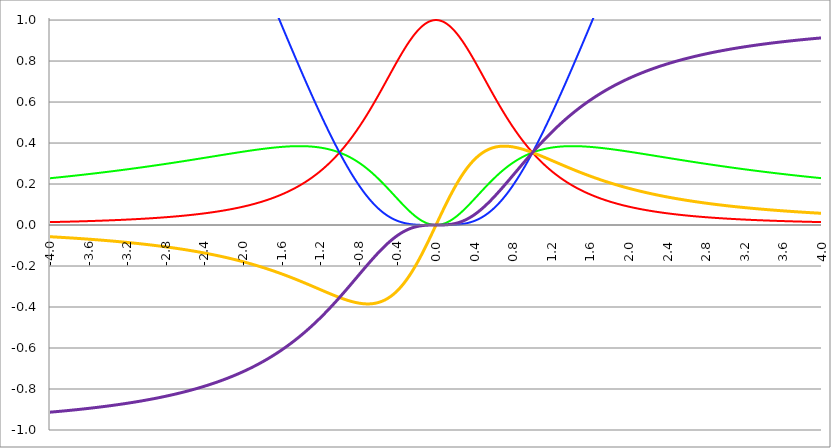
| Category | Series 1 | Series 0 | Series 2 | Series 3 | Series 4 |
|---|---|---|---|---|---|
| -4.0 | 0.014 | 0.228 | 3.652 | -0.057 | -0.913 |
| -3.996 | 0.014 | 0.228 | 3.648 | -0.057 | -0.913 |
| -3.992 | 0.014 | 0.229 | 3.644 | -0.057 | -0.913 |
| -3.988 | 0.014 | 0.229 | 3.639 | -0.057 | -0.913 |
| -3.984 | 0.014 | 0.229 | 3.635 | -0.057 | -0.912 |
| -3.98 | 0.014 | 0.229 | 3.631 | -0.058 | -0.912 |
| -3.976 | 0.015 | 0.229 | 3.627 | -0.058 | -0.912 |
| -3.972 | 0.015 | 0.23 | 3.622 | -0.058 | -0.912 |
| -3.968 | 0.015 | 0.23 | 3.618 | -0.058 | -0.912 |
| -3.964 | 0.015 | 0.23 | 3.614 | -0.058 | -0.912 |
| -3.96 | 0.015 | 0.23 | 3.609 | -0.058 | -0.911 |
| -3.956 | 0.015 | 0.23 | 3.605 | -0.058 | -0.911 |
| -3.952 | 0.015 | 0.231 | 3.601 | -0.058 | -0.911 |
| -3.948 | 0.015 | 0.231 | 3.596 | -0.058 | -0.911 |
| -3.944 | 0.015 | 0.231 | 3.592 | -0.059 | -0.911 |
| -3.94 | 0.015 | 0.231 | 3.588 | -0.059 | -0.911 |
| -3.936 | 0.015 | 0.231 | 3.583 | -0.059 | -0.91 |
| -3.932 | 0.015 | 0.232 | 3.579 | -0.059 | -0.91 |
| -3.928 | 0.015 | 0.232 | 3.575 | -0.059 | -0.91 |
| -3.924 | 0.015 | 0.232 | 3.571 | -0.059 | -0.91 |
| -3.92 | 0.015 | 0.232 | 3.566 | -0.059 | -0.91 |
| -3.916 | 0.015 | 0.232 | 3.562 | -0.059 | -0.91 |
| -3.912 | 0.015 | 0.232 | 3.558 | -0.059 | -0.909 |
| -3.908 | 0.015 | 0.233 | 3.553 | -0.06 | -0.909 |
| -3.904 | 0.015 | 0.233 | 3.549 | -0.06 | -0.909 |
| -3.9 | 0.015 | 0.233 | 3.545 | -0.06 | -0.909 |
| -3.896 | 0.015 | 0.233 | 3.54 | -0.06 | -0.909 |
| -3.892 | 0.015 | 0.233 | 3.536 | -0.06 | -0.909 |
| -3.888 | 0.015 | 0.234 | 3.532 | -0.06 | -0.908 |
| -3.884 | 0.016 | 0.234 | 3.527 | -0.06 | -0.908 |
| -3.88 | 0.016 | 0.234 | 3.523 | -0.06 | -0.908 |
| -3.876 | 0.016 | 0.234 | 3.519 | -0.06 | -0.908 |
| -3.872 | 0.016 | 0.234 | 3.515 | -0.061 | -0.908 |
| -3.868 | 0.016 | 0.235 | 3.51 | -0.061 | -0.908 |
| -3.864 | 0.016 | 0.235 | 3.506 | -0.061 | -0.907 |
| -3.86 | 0.016 | 0.235 | 3.502 | -0.061 | -0.907 |
| -3.856 | 0.016 | 0.235 | 3.497 | -0.061 | -0.907 |
| -3.852 | 0.016 | 0.235 | 3.493 | -0.061 | -0.907 |
| -3.848 | 0.016 | 0.236 | 3.489 | -0.061 | -0.907 |
| -3.844 | 0.016 | 0.236 | 3.484 | -0.061 | -0.906 |
| -3.84 | 0.016 | 0.236 | 3.48 | -0.061 | -0.906 |
| -3.836 | 0.016 | 0.236 | 3.476 | -0.062 | -0.906 |
| -3.832 | 0.016 | 0.236 | 3.471 | -0.062 | -0.906 |
| -3.828 | 0.016 | 0.237 | 3.467 | -0.062 | -0.906 |
| -3.824 | 0.016 | 0.237 | 3.463 | -0.062 | -0.906 |
| -3.82 | 0.016 | 0.237 | 3.458 | -0.062 | -0.905 |
| -3.816 | 0.016 | 0.237 | 3.454 | -0.062 | -0.905 |
| -3.812 | 0.016 | 0.237 | 3.45 | -0.062 | -0.905 |
| -3.808 | 0.016 | 0.238 | 3.446 | -0.062 | -0.905 |
| -3.804 | 0.016 | 0.238 | 3.441 | -0.063 | -0.905 |
| -3.8 | 0.016 | 0.238 | 3.437 | -0.063 | -0.904 |
| -3.796 | 0.017 | 0.238 | 3.433 | -0.063 | -0.904 |
| -3.792 | 0.017 | 0.238 | 3.428 | -0.063 | -0.904 |
| -3.788 | 0.017 | 0.239 | 3.424 | -0.063 | -0.904 |
| -3.784 | 0.017 | 0.239 | 3.42 | -0.063 | -0.904 |
| -3.78 | 0.017 | 0.239 | 3.415 | -0.063 | -0.904 |
| -3.776 | 0.017 | 0.239 | 3.411 | -0.063 | -0.903 |
| -3.772 | 0.017 | 0.239 | 3.407 | -0.063 | -0.903 |
| -3.768 | 0.017 | 0.24 | 3.402 | -0.064 | -0.903 |
| -3.764 | 0.017 | 0.24 | 3.398 | -0.064 | -0.903 |
| -3.76 | 0.017 | 0.24 | 3.394 | -0.064 | -0.903 |
| -3.756 | 0.017 | 0.24 | 3.389 | -0.064 | -0.902 |
| -3.752 | 0.017 | 0.24 | 3.385 | -0.064 | -0.902 |
| -3.748 | 0.017 | 0.241 | 3.381 | -0.064 | -0.902 |
| -3.744 | 0.017 | 0.241 | 3.376 | -0.064 | -0.902 |
| -3.74 | 0.017 | 0.241 | 3.372 | -0.064 | -0.902 |
| -3.736 | 0.017 | 0.241 | 3.368 | -0.065 | -0.901 |
| -3.732 | 0.017 | 0.241 | 3.363 | -0.065 | -0.901 |
| -3.728 | 0.017 | 0.242 | 3.359 | -0.065 | -0.901 |
| -3.724 | 0.017 | 0.242 | 3.355 | -0.065 | -0.901 |
| -3.72 | 0.017 | 0.242 | 3.35 | -0.065 | -0.901 |
| -3.716 | 0.018 | 0.242 | 3.346 | -0.065 | -0.9 |
| -3.712 | 0.018 | 0.243 | 3.342 | -0.065 | -0.9 |
| -3.708 | 0.018 | 0.243 | 3.337 | -0.065 | -0.9 |
| -3.704 | 0.018 | 0.243 | 3.333 | -0.066 | -0.9 |
| -3.7 | 0.018 | 0.243 | 3.329 | -0.066 | -0.9 |
| -3.696 | 0.018 | 0.243 | 3.324 | -0.066 | -0.899 |
| -3.692 | 0.018 | 0.244 | 3.32 | -0.066 | -0.899 |
| -3.688 | 0.018 | 0.244 | 3.316 | -0.066 | -0.899 |
| -3.684 | 0.018 | 0.244 | 3.311 | -0.066 | -0.899 |
| -3.68 | 0.018 | 0.244 | 3.307 | -0.066 | -0.899 |
| -3.676 | 0.018 | 0.244 | 3.303 | -0.066 | -0.898 |
| -3.672 | 0.018 | 0.245 | 3.298 | -0.067 | -0.898 |
| -3.668 | 0.018 | 0.245 | 3.294 | -0.067 | -0.898 |
| -3.664 | 0.018 | 0.245 | 3.29 | -0.067 | -0.898 |
| -3.66 | 0.018 | 0.245 | 3.285 | -0.067 | -0.898 |
| -3.656 | 0.018 | 0.245 | 3.281 | -0.067 | -0.897 |
| -3.652 | 0.018 | 0.246 | 3.277 | -0.067 | -0.897 |
| -3.648 | 0.018 | 0.246 | 3.272 | -0.067 | -0.897 |
| -3.644 | 0.019 | 0.246 | 3.268 | -0.068 | -0.897 |
| -3.64 | 0.019 | 0.246 | 3.264 | -0.068 | -0.897 |
| -3.636 | 0.019 | 0.247 | 3.259 | -0.068 | -0.896 |
| -3.632 | 0.019 | 0.247 | 3.255 | -0.068 | -0.896 |
| -3.628 | 0.019 | 0.247 | 3.251 | -0.068 | -0.896 |
| -3.624 | 0.019 | 0.247 | 3.246 | -0.068 | -0.896 |
| -3.62 | 0.019 | 0.247 | 3.242 | -0.068 | -0.896 |
| -3.616 | 0.019 | 0.248 | 3.238 | -0.068 | -0.895 |
| -3.612 | 0.019 | 0.248 | 3.233 | -0.069 | -0.895 |
| -3.608 | 0.019 | 0.248 | 3.229 | -0.069 | -0.895 |
| -3.604 | 0.019 | 0.248 | 3.225 | -0.069 | -0.895 |
| -3.6 | 0.019 | 0.248 | 3.22 | -0.069 | -0.894 |
| -3.596 | 0.019 | 0.249 | 3.216 | -0.069 | -0.894 |
| -3.592 | 0.019 | 0.249 | 3.211 | -0.069 | -0.894 |
| -3.588 | 0.019 | 0.249 | 3.207 | -0.069 | -0.894 |
| -3.584 | 0.019 | 0.249 | 3.203 | -0.07 | -0.894 |
| -3.58 | 0.019 | 0.25 | 3.198 | -0.07 | -0.893 |
| -3.576 | 0.02 | 0.25 | 3.194 | -0.07 | -0.893 |
| -3.572 | 0.02 | 0.25 | 3.19 | -0.07 | -0.893 |
| -3.568 | 0.02 | 0.25 | 3.185 | -0.07 | -0.893 |
| -3.564 | 0.02 | 0.25 | 3.181 | -0.07 | -0.893 |
| -3.56 | 0.02 | 0.251 | 3.177 | -0.07 | -0.892 |
| -3.556 | 0.02 | 0.251 | 3.172 | -0.071 | -0.892 |
| -3.552 | 0.02 | 0.251 | 3.168 | -0.071 | -0.892 |
| -3.548 | 0.02 | 0.251 | 3.164 | -0.071 | -0.892 |
| -3.544 | 0.02 | 0.252 | 3.159 | -0.071 | -0.891 |
| -3.54 | 0.02 | 0.252 | 3.155 | -0.071 | -0.891 |
| -3.536 | 0.02 | 0.252 | 3.151 | -0.071 | -0.891 |
| -3.532 | 0.02 | 0.252 | 3.146 | -0.071 | -0.891 |
| -3.528 | 0.02 | 0.252 | 3.142 | -0.072 | -0.891 |
| -3.524 | 0.02 | 0.253 | 3.138 | -0.072 | -0.89 |
| -3.52 | 0.02 | 0.253 | 3.133 | -0.072 | -0.89 |
| -3.516 | 0.02 | 0.253 | 3.129 | -0.072 | -0.89 |
| -3.512 | 0.021 | 0.253 | 3.124 | -0.072 | -0.89 |
| -3.508 | 0.021 | 0.254 | 3.12 | -0.072 | -0.889 |
| -3.504 | 0.021 | 0.254 | 3.116 | -0.072 | -0.889 |
| -3.5 | 0.021 | 0.254 | 3.111 | -0.073 | -0.889 |
| -3.496 | 0.021 | 0.254 | 3.107 | -0.073 | -0.889 |
| -3.492 | 0.021 | 0.254 | 3.103 | -0.073 | -0.888 |
| -3.488 | 0.021 | 0.255 | 3.098 | -0.073 | -0.888 |
| -3.484 | 0.021 | 0.255 | 3.094 | -0.073 | -0.888 |
| -3.48 | 0.021 | 0.255 | 3.09 | -0.073 | -0.888 |
| -3.476 | 0.021 | 0.255 | 3.085 | -0.073 | -0.888 |
| -3.472 | 0.021 | 0.256 | 3.081 | -0.074 | -0.887 |
| -3.467999999999999 | 0.021 | 0.256 | 3.076 | -0.074 | -0.887 |
| -3.463999999999999 | 0.021 | 0.256 | 3.072 | -0.074 | -0.887 |
| -3.459999999999999 | 0.021 | 0.256 | 3.068 | -0.074 | -0.887 |
| -3.455999999999999 | 0.021 | 0.256 | 3.063 | -0.074 | -0.886 |
| -3.451999999999999 | 0.022 | 0.257 | 3.059 | -0.074 | -0.886 |
| -3.447999999999999 | 0.022 | 0.257 | 3.055 | -0.075 | -0.886 |
| -3.443999999999999 | 0.022 | 0.257 | 3.05 | -0.075 | -0.886 |
| -3.439999999999999 | 0.022 | 0.257 | 3.046 | -0.075 | -0.885 |
| -3.435999999999999 | 0.022 | 0.258 | 3.041 | -0.075 | -0.885 |
| -3.431999999999999 | 0.022 | 0.258 | 3.037 | -0.075 | -0.885 |
| -3.427999999999999 | 0.022 | 0.258 | 3.033 | -0.075 | -0.885 |
| -3.423999999999999 | 0.022 | 0.258 | 3.028 | -0.075 | -0.884 |
| -3.419999999999999 | 0.022 | 0.259 | 3.024 | -0.076 | -0.884 |
| -3.415999999999999 | 0.022 | 0.259 | 3.02 | -0.076 | -0.884 |
| -3.411999999999999 | 0.022 | 0.259 | 3.015 | -0.076 | -0.884 |
| -3.407999999999999 | 0.022 | 0.259 | 3.011 | -0.076 | -0.883 |
| -3.403999999999999 | 0.022 | 0.259 | 3.007 | -0.076 | -0.883 |
| -3.399999999999999 | 0.022 | 0.26 | 3.002 | -0.076 | -0.883 |
| -3.395999999999999 | 0.023 | 0.26 | 2.998 | -0.077 | -0.883 |
| -3.391999999999999 | 0.023 | 0.26 | 2.993 | -0.077 | -0.882 |
| -3.387999999999999 | 0.023 | 0.26 | 2.989 | -0.077 | -0.882 |
| -3.383999999999999 | 0.023 | 0.261 | 2.985 | -0.077 | -0.882 |
| -3.379999999999999 | 0.023 | 0.261 | 2.98 | -0.077 | -0.882 |
| -3.375999999999999 | 0.023 | 0.261 | 2.976 | -0.077 | -0.881 |
| -3.371999999999999 | 0.023 | 0.261 | 2.971 | -0.078 | -0.881 |
| -3.367999999999999 | 0.023 | 0.262 | 2.967 | -0.078 | -0.881 |
| -3.363999999999999 | 0.023 | 0.262 | 2.963 | -0.078 | -0.881 |
| -3.359999999999999 | 0.023 | 0.262 | 2.958 | -0.078 | -0.88 |
| -3.355999999999999 | 0.023 | 0.262 | 2.954 | -0.078 | -0.88 |
| -3.351999999999999 | 0.023 | 0.263 | 2.95 | -0.078 | -0.88 |
| -3.347999999999999 | 0.023 | 0.263 | 2.945 | -0.078 | -0.88 |
| -3.343999999999999 | 0.024 | 0.263 | 2.941 | -0.079 | -0.879 |
| -3.339999999999999 | 0.024 | 0.263 | 2.936 | -0.079 | -0.879 |
| -3.335999999999999 | 0.024 | 0.263 | 2.932 | -0.079 | -0.879 |
| -3.331999999999999 | 0.024 | 0.264 | 2.928 | -0.079 | -0.879 |
| -3.327999999999999 | 0.024 | 0.264 | 2.923 | -0.079 | -0.878 |
| -3.323999999999999 | 0.024 | 0.264 | 2.919 | -0.079 | -0.878 |
| -3.319999999999999 | 0.024 | 0.264 | 2.915 | -0.08 | -0.878 |
| -3.315999999999999 | 0.024 | 0.265 | 2.91 | -0.08 | -0.878 |
| -3.311999999999999 | 0.024 | 0.265 | 2.906 | -0.08 | -0.877 |
| -3.307999999999999 | 0.024 | 0.265 | 2.901 | -0.08 | -0.877 |
| -3.303999999999999 | 0.024 | 0.265 | 2.897 | -0.08 | -0.877 |
| -3.299999999999999 | 0.024 | 0.266 | 2.893 | -0.08 | -0.877 |
| -3.295999999999999 | 0.024 | 0.266 | 2.888 | -0.081 | -0.876 |
| -3.291999999999999 | 0.025 | 0.266 | 2.884 | -0.081 | -0.876 |
| -3.288 | 0.025 | 0.266 | 2.879 | -0.081 | -0.876 |
| -3.284 | 0.025 | 0.267 | 2.875 | -0.081 | -0.875 |
| -3.279999999999999 | 0.025 | 0.267 | 2.871 | -0.081 | -0.875 |
| -3.275999999999999 | 0.025 | 0.267 | 2.866 | -0.082 | -0.875 |
| -3.271999999999999 | 0.025 | 0.267 | 2.862 | -0.082 | -0.875 |
| -3.268 | 0.025 | 0.268 | 2.857 | -0.082 | -0.874 |
| -3.264 | 0.025 | 0.268 | 2.853 | -0.082 | -0.874 |
| -3.259999999999999 | 0.025 | 0.268 | 2.849 | -0.082 | -0.874 |
| -3.255999999999999 | 0.025 | 0.268 | 2.844 | -0.082 | -0.874 |
| -3.251999999999999 | 0.025 | 0.269 | 2.84 | -0.083 | -0.873 |
| -3.248 | 0.025 | 0.269 | 2.835 | -0.083 | -0.873 |
| -3.244 | 0.026 | 0.269 | 2.831 | -0.083 | -0.873 |
| -3.239999999999999 | 0.026 | 0.269 | 2.827 | -0.083 | -0.872 |
| -3.235999999999999 | 0.026 | 0.27 | 2.822 | -0.083 | -0.872 |
| -3.231999999999999 | 0.026 | 0.27 | 2.818 | -0.083 | -0.872 |
| -3.228 | 0.026 | 0.27 | 2.813 | -0.084 | -0.872 |
| -3.224 | 0.026 | 0.27 | 2.809 | -0.084 | -0.871 |
| -3.219999999999999 | 0.026 | 0.27 | 2.805 | -0.084 | -0.871 |
| -3.215999999999999 | 0.026 | 0.271 | 2.8 | -0.084 | -0.871 |
| -3.211999999999999 | 0.026 | 0.271 | 2.796 | -0.084 | -0.87 |
| -3.208 | 0.026 | 0.271 | 2.791 | -0.085 | -0.87 |
| -3.204 | 0.026 | 0.271 | 2.787 | -0.085 | -0.87 |
| -3.199999999999999 | 0.027 | 0.272 | 2.783 | -0.085 | -0.87 |
| -3.195999999999999 | 0.027 | 0.272 | 2.778 | -0.085 | -0.869 |
| -3.191999999999999 | 0.027 | 0.272 | 2.774 | -0.085 | -0.869 |
| -3.188 | 0.027 | 0.272 | 2.769 | -0.085 | -0.869 |
| -3.184 | 0.027 | 0.273 | 2.765 | -0.086 | -0.868 |
| -3.179999999999999 | 0.027 | 0.273 | 2.761 | -0.086 | -0.868 |
| -3.175999999999999 | 0.027 | 0.273 | 2.756 | -0.086 | -0.868 |
| -3.171999999999999 | 0.027 | 0.273 | 2.752 | -0.086 | -0.868 |
| -3.168 | 0.027 | 0.274 | 2.747 | -0.086 | -0.867 |
| -3.164 | 0.027 | 0.274 | 2.743 | -0.087 | -0.867 |
| -3.159999999999999 | 0.027 | 0.274 | 2.738 | -0.087 | -0.867 |
| -3.155999999999999 | 0.028 | 0.274 | 2.734 | -0.087 | -0.866 |
| -3.151999999999999 | 0.028 | 0.275 | 2.73 | -0.087 | -0.866 |
| -3.148 | 0.028 | 0.275 | 2.725 | -0.087 | -0.866 |
| -3.144 | 0.028 | 0.275 | 2.721 | -0.088 | -0.865 |
| -3.139999999999999 | 0.028 | 0.276 | 2.716 | -0.088 | -0.865 |
| -3.135999999999999 | 0.028 | 0.276 | 2.712 | -0.088 | -0.865 |
| -3.131999999999999 | 0.028 | 0.276 | 2.708 | -0.088 | -0.864 |
| -3.128 | 0.028 | 0.276 | 2.703 | -0.088 | -0.864 |
| -3.124 | 0.028 | 0.277 | 2.699 | -0.089 | -0.864 |
| -3.119999999999999 | 0.028 | 0.277 | 2.694 | -0.089 | -0.864 |
| -3.115999999999999 | 0.029 | 0.277 | 2.69 | -0.089 | -0.863 |
| -3.111999999999999 | 0.029 | 0.277 | 2.685 | -0.089 | -0.863 |
| -3.108 | 0.029 | 0.278 | 2.681 | -0.089 | -0.863 |
| -3.104 | 0.029 | 0.278 | 2.677 | -0.09 | -0.862 |
| -3.099999999999999 | 0.029 | 0.278 | 2.672 | -0.09 | -0.862 |
| -3.095999999999999 | 0.029 | 0.278 | 2.668 | -0.09 | -0.862 |
| -3.091999999999999 | 0.029 | 0.279 | 2.663 | -0.09 | -0.861 |
| -3.088 | 0.029 | 0.279 | 2.659 | -0.09 | -0.861 |
| -3.084 | 0.029 | 0.279 | 2.655 | -0.09 | -0.861 |
| -3.079999999999999 | 0.029 | 0.279 | 2.65 | -0.091 | -0.86 |
| -3.075999999999999 | 0.03 | 0.28 | 2.646 | -0.091 | -0.86 |
| -3.071999999999999 | 0.03 | 0.28 | 2.641 | -0.091 | -0.86 |
| -3.068 | 0.03 | 0.28 | 2.637 | -0.091 | -0.859 |
| -3.064 | 0.03 | 0.28 | 2.632 | -0.092 | -0.859 |
| -3.059999999999999 | 0.03 | 0.281 | 2.628 | -0.092 | -0.859 |
| -3.055999999999999 | 0.03 | 0.281 | 2.624 | -0.092 | -0.858 |
| -3.051999999999999 | 0.03 | 0.281 | 2.619 | -0.092 | -0.858 |
| -3.048 | 0.03 | 0.281 | 2.615 | -0.092 | -0.858 |
| -3.044 | 0.03 | 0.282 | 2.61 | -0.093 | -0.858 |
| -3.039999999999999 | 0.031 | 0.282 | 2.606 | -0.093 | -0.857 |
| -3.035999999999999 | 0.031 | 0.282 | 2.601 | -0.093 | -0.857 |
| -3.031999999999999 | 0.031 | 0.282 | 2.597 | -0.093 | -0.857 |
| -3.028 | 0.031 | 0.283 | 2.593 | -0.093 | -0.856 |
| -3.024 | 0.031 | 0.283 | 2.588 | -0.094 | -0.856 |
| -3.019999999999999 | 0.031 | 0.283 | 2.584 | -0.094 | -0.856 |
| -3.015999999999999 | 0.031 | 0.284 | 2.579 | -0.094 | -0.855 |
| -3.011999999999999 | 0.031 | 0.284 | 2.575 | -0.094 | -0.855 |
| -3.008 | 0.031 | 0.284 | 2.57 | -0.094 | -0.854 |
| -3.004 | 0.032 | 0.284 | 2.566 | -0.095 | -0.854 |
| -2.999999999999999 | 0.032 | 0.285 | 2.561 | -0.095 | -0.854 |
| -2.995999999999999 | 0.032 | 0.285 | 2.557 | -0.095 | -0.853 |
| -2.991999999999999 | 0.032 | 0.285 | 2.553 | -0.095 | -0.853 |
| -2.988 | 0.032 | 0.285 | 2.548 | -0.096 | -0.853 |
| -2.984 | 0.032 | 0.286 | 2.544 | -0.096 | -0.852 |
| -2.979999999999999 | 0.032 | 0.286 | 2.539 | -0.096 | -0.852 |
| -2.975999999999999 | 0.032 | 0.286 | 2.535 | -0.096 | -0.852 |
| -2.971999999999999 | 0.032 | 0.286 | 2.53 | -0.096 | -0.851 |
| -2.968 | 0.033 | 0.287 | 2.526 | -0.097 | -0.851 |
| -2.964 | 0.033 | 0.287 | 2.521 | -0.097 | -0.851 |
| -2.959999999999999 | 0.033 | 0.287 | 2.517 | -0.097 | -0.85 |
| -2.955999999999999 | 0.033 | 0.288 | 2.513 | -0.097 | -0.85 |
| -2.951999999999999 | 0.033 | 0.288 | 2.508 | -0.097 | -0.85 |
| -2.948 | 0.033 | 0.288 | 2.504 | -0.098 | -0.849 |
| -2.944 | 0.033 | 0.288 | 2.499 | -0.098 | -0.849 |
| -2.939999999999999 | 0.033 | 0.289 | 2.495 | -0.098 | -0.849 |
| -2.935999999999999 | 0.034 | 0.289 | 2.49 | -0.098 | -0.848 |
| -2.931999999999999 | 0.034 | 0.289 | 2.486 | -0.099 | -0.848 |
| -2.928 | 0.034 | 0.289 | 2.481 | -0.099 | -0.847 |
| -2.924 | 0.034 | 0.29 | 2.477 | -0.099 | -0.847 |
| -2.919999999999999 | 0.034 | 0.29 | 2.473 | -0.099 | -0.847 |
| -2.915999999999999 | 0.034 | 0.29 | 2.468 | -0.1 | -0.846 |
| -2.911999999999999 | 0.034 | 0.291 | 2.464 | -0.1 | -0.846 |
| -2.908 | 0.034 | 0.291 | 2.459 | -0.1 | -0.846 |
| -2.904 | 0.035 | 0.291 | 2.455 | -0.1 | -0.845 |
| -2.899999999999999 | 0.035 | 0.291 | 2.45 | -0.1 | -0.845 |
| -2.895999999999999 | 0.035 | 0.292 | 2.446 | -0.101 | -0.845 |
| -2.891999999999999 | 0.035 | 0.292 | 2.441 | -0.101 | -0.844 |
| -2.887999999999999 | 0.035 | 0.292 | 2.437 | -0.101 | -0.844 |
| -2.883999999999999 | 0.035 | 0.292 | 2.432 | -0.101 | -0.843 |
| -2.879999999999999 | 0.035 | 0.293 | 2.428 | -0.102 | -0.843 |
| -2.875999999999999 | 0.035 | 0.293 | 2.423 | -0.102 | -0.843 |
| -2.871999999999999 | 0.036 | 0.293 | 2.419 | -0.102 | -0.842 |
| -2.867999999999999 | 0.036 | 0.294 | 2.415 | -0.102 | -0.842 |
| -2.863999999999999 | 0.036 | 0.294 | 2.41 | -0.103 | -0.842 |
| -2.859999999999999 | 0.036 | 0.294 | 2.406 | -0.103 | -0.841 |
| -2.855999999999999 | 0.036 | 0.294 | 2.401 | -0.103 | -0.841 |
| -2.851999999999999 | 0.036 | 0.295 | 2.397 | -0.103 | -0.84 |
| -2.847999999999999 | 0.036 | 0.295 | 2.392 | -0.104 | -0.84 |
| -2.843999999999999 | 0.036 | 0.295 | 2.388 | -0.104 | -0.84 |
| -2.839999999999999 | 0.037 | 0.295 | 2.383 | -0.104 | -0.839 |
| -2.835999999999999 | 0.037 | 0.296 | 2.379 | -0.104 | -0.839 |
| -2.831999999999999 | 0.037 | 0.296 | 2.374 | -0.105 | -0.838 |
| -2.827999999999999 | 0.037 | 0.296 | 2.37 | -0.105 | -0.838 |
| -2.823999999999999 | 0.037 | 0.297 | 2.365 | -0.105 | -0.838 |
| -2.819999999999999 | 0.037 | 0.297 | 2.361 | -0.105 | -0.837 |
| -2.815999999999999 | 0.037 | 0.297 | 2.356 | -0.106 | -0.837 |
| -2.811999999999999 | 0.038 | 0.297 | 2.352 | -0.106 | -0.836 |
| -2.807999999999999 | 0.038 | 0.298 | 2.348 | -0.106 | -0.836 |
| -2.803999999999999 | 0.038 | 0.298 | 2.343 | -0.106 | -0.836 |
| -2.799999999999999 | 0.038 | 0.298 | 2.339 | -0.107 | -0.835 |
| -2.795999999999999 | 0.038 | 0.299 | 2.334 | -0.107 | -0.835 |
| -2.791999999999999 | 0.038 | 0.299 | 2.33 | -0.107 | -0.834 |
| -2.787999999999999 | 0.038 | 0.299 | 2.325 | -0.107 | -0.834 |
| -2.783999999999999 | 0.039 | 0.299 | 2.321 | -0.108 | -0.834 |
| -2.779999999999999 | 0.039 | 0.3 | 2.316 | -0.108 | -0.833 |
| -2.775999999999999 | 0.039 | 0.3 | 2.312 | -0.108 | -0.833 |
| -2.771999999999999 | 0.039 | 0.3 | 2.307 | -0.108 | -0.832 |
| -2.767999999999999 | 0.039 | 0.301 | 2.303 | -0.109 | -0.832 |
| -2.763999999999999 | 0.039 | 0.301 | 2.298 | -0.109 | -0.832 |
| -2.759999999999999 | 0.04 | 0.301 | 2.294 | -0.109 | -0.831 |
| -2.755999999999999 | 0.04 | 0.301 | 2.289 | -0.109 | -0.831 |
| -2.751999999999999 | 0.04 | 0.302 | 2.285 | -0.11 | -0.83 |
| -2.747999999999999 | 0.04 | 0.302 | 2.28 | -0.11 | -0.83 |
| -2.743999999999999 | 0.04 | 0.302 | 2.276 | -0.11 | -0.829 |
| -2.739999999999999 | 0.04 | 0.303 | 2.271 | -0.11 | -0.829 |
| -2.735999999999999 | 0.04 | 0.303 | 2.267 | -0.111 | -0.829 |
| -2.731999999999999 | 0.041 | 0.303 | 2.262 | -0.111 | -0.828 |
| -2.727999999999999 | 0.041 | 0.303 | 2.258 | -0.111 | -0.828 |
| -2.723999999999999 | 0.041 | 0.304 | 2.253 | -0.111 | -0.827 |
| -2.719999999999999 | 0.041 | 0.304 | 2.249 | -0.112 | -0.827 |
| -2.715999999999999 | 0.041 | 0.304 | 2.244 | -0.112 | -0.826 |
| -2.711999999999999 | 0.041 | 0.305 | 2.24 | -0.112 | -0.826 |
| -2.707999999999999 | 0.042 | 0.305 | 2.235 | -0.113 | -0.826 |
| -2.703999999999999 | 0.042 | 0.305 | 2.231 | -0.113 | -0.825 |
| -2.699999999999999 | 0.042 | 0.305 | 2.227 | -0.113 | -0.825 |
| -2.695999999999999 | 0.042 | 0.306 | 2.222 | -0.113 | -0.824 |
| -2.691999999999999 | 0.042 | 0.306 | 2.218 | -0.114 | -0.824 |
| -2.687999999999999 | 0.042 | 0.306 | 2.213 | -0.114 | -0.823 |
| -2.683999999999999 | 0.043 | 0.307 | 2.209 | -0.114 | -0.823 |
| -2.679999999999999 | 0.043 | 0.307 | 2.204 | -0.115 | -0.822 |
| -2.675999999999999 | 0.043 | 0.307 | 2.2 | -0.115 | -0.822 |
| -2.671999999999999 | 0.043 | 0.307 | 2.195 | -0.115 | -0.821 |
| -2.667999999999999 | 0.043 | 0.308 | 2.191 | -0.115 | -0.821 |
| -2.663999999999999 | 0.043 | 0.308 | 2.186 | -0.116 | -0.821 |
| -2.659999999999999 | 0.044 | 0.308 | 2.182 | -0.116 | -0.82 |
| -2.655999999999999 | 0.044 | 0.309 | 2.177 | -0.116 | -0.82 |
| -2.651999999999999 | 0.044 | 0.309 | 2.173 | -0.116 | -0.819 |
| -2.647999999999999 | 0.044 | 0.309 | 2.168 | -0.117 | -0.819 |
| -2.643999999999999 | 0.044 | 0.309 | 2.164 | -0.117 | -0.818 |
| -2.639999999999999 | 0.044 | 0.31 | 2.159 | -0.117 | -0.818 |
| -2.635999999999999 | 0.045 | 0.31 | 2.155 | -0.118 | -0.817 |
| -2.631999999999999 | 0.045 | 0.31 | 2.15 | -0.118 | -0.817 |
| -2.627999999999999 | 0.045 | 0.311 | 2.146 | -0.118 | -0.816 |
| -2.623999999999999 | 0.045 | 0.311 | 2.141 | -0.119 | -0.816 |
| -2.619999999999999 | 0.045 | 0.311 | 2.137 | -0.119 | -0.815 |
| -2.615999999999999 | 0.046 | 0.312 | 2.132 | -0.119 | -0.815 |
| -2.611999999999999 | 0.046 | 0.312 | 2.128 | -0.119 | -0.815 |
| -2.607999999999999 | 0.046 | 0.312 | 2.123 | -0.12 | -0.814 |
| -2.603999999999999 | 0.046 | 0.312 | 2.118 | -0.12 | -0.814 |
| -2.599999999999999 | 0.046 | 0.313 | 2.114 | -0.12 | -0.813 |
| -2.595999999999999 | 0.046 | 0.313 | 2.109 | -0.121 | -0.813 |
| -2.591999999999999 | 0.047 | 0.313 | 2.105 | -0.121 | -0.812 |
| -2.587999999999999 | 0.047 | 0.314 | 2.1 | -0.121 | -0.812 |
| -2.583999999999999 | 0.047 | 0.314 | 2.096 | -0.121 | -0.811 |
| -2.579999999999999 | 0.047 | 0.314 | 2.091 | -0.122 | -0.811 |
| -2.575999999999999 | 0.047 | 0.314 | 2.087 | -0.122 | -0.81 |
| -2.571999999999999 | 0.048 | 0.315 | 2.082 | -0.122 | -0.81 |
| -2.567999999999999 | 0.048 | 0.315 | 2.078 | -0.123 | -0.809 |
| -2.563999999999999 | 0.048 | 0.315 | 2.073 | -0.123 | -0.809 |
| -2.559999999999999 | 0.048 | 0.316 | 2.069 | -0.123 | -0.808 |
| -2.555999999999999 | 0.048 | 0.316 | 2.064 | -0.124 | -0.808 |
| -2.551999999999999 | 0.049 | 0.316 | 2.06 | -0.124 | -0.807 |
| -2.547999999999999 | 0.049 | 0.317 | 2.055 | -0.124 | -0.807 |
| -2.543999999999999 | 0.049 | 0.317 | 2.051 | -0.125 | -0.806 |
| -2.539999999999999 | 0.049 | 0.317 | 2.046 | -0.125 | -0.806 |
| -2.535999999999999 | 0.049 | 0.317 | 2.042 | -0.125 | -0.805 |
| -2.531999999999999 | 0.05 | 0.318 | 2.037 | -0.126 | -0.805 |
| -2.527999999999999 | 0.05 | 0.318 | 2.033 | -0.126 | -0.804 |
| -2.523999999999999 | 0.05 | 0.318 | 2.028 | -0.126 | -0.804 |
| -2.519999999999999 | 0.05 | 0.319 | 2.024 | -0.126 | -0.803 |
| -2.515999999999999 | 0.05 | 0.319 | 2.019 | -0.127 | -0.803 |
| -2.511999999999999 | 0.051 | 0.319 | 2.015 | -0.127 | -0.802 |
| -2.507999999999999 | 0.051 | 0.32 | 2.01 | -0.127 | -0.801 |
| -2.503999999999999 | 0.051 | 0.32 | 2.006 | -0.128 | -0.801 |
| -2.499999999999999 | 0.051 | 0.32 | 2.001 | -0.128 | -0.8 |
| -2.495999999999999 | 0.051 | 0.32 | 1.997 | -0.128 | -0.8 |
| -2.491999999999999 | 0.052 | 0.321 | 1.992 | -0.129 | -0.799 |
| -2.487999999999999 | 0.052 | 0.321 | 1.987 | -0.129 | -0.799 |
| -2.483999999999999 | 0.052 | 0.321 | 1.983 | -0.129 | -0.798 |
| -2.479999999999999 | 0.052 | 0.322 | 1.978 | -0.13 | -0.798 |
| -2.475999999999999 | 0.053 | 0.322 | 1.974 | -0.13 | -0.797 |
| -2.471999999999999 | 0.053 | 0.322 | 1.969 | -0.13 | -0.797 |
| -2.467999999999999 | 0.053 | 0.323 | 1.965 | -0.131 | -0.796 |
| -2.463999999999999 | 0.053 | 0.323 | 1.96 | -0.131 | -0.796 |
| -2.459999999999999 | 0.053 | 0.323 | 1.956 | -0.131 | -0.795 |
| -2.455999999999999 | 0.054 | 0.323 | 1.951 | -0.132 | -0.794 |
| -2.451999999999999 | 0.054 | 0.324 | 1.947 | -0.132 | -0.794 |
| -2.447999999999999 | 0.054 | 0.324 | 1.942 | -0.132 | -0.793 |
| -2.443999999999999 | 0.054 | 0.324 | 1.938 | -0.133 | -0.793 |
| -2.439999999999999 | 0.055 | 0.325 | 1.933 | -0.133 | -0.792 |
| -2.435999999999999 | 0.055 | 0.325 | 1.929 | -0.133 | -0.792 |
| -2.431999999999999 | 0.055 | 0.325 | 1.924 | -0.134 | -0.791 |
| -2.427999999999999 | 0.055 | 0.326 | 1.919 | -0.134 | -0.791 |
| -2.423999999999999 | 0.055 | 0.326 | 1.915 | -0.134 | -0.79 |
| -2.419999999999999 | 0.056 | 0.326 | 1.91 | -0.135 | -0.789 |
| -2.415999999999999 | 0.056 | 0.327 | 1.906 | -0.135 | -0.789 |
| -2.411999999999999 | 0.056 | 0.327 | 1.901 | -0.135 | -0.788 |
| -2.407999999999999 | 0.056 | 0.327 | 1.897 | -0.136 | -0.788 |
| -2.403999999999999 | 0.057 | 0.327 | 1.892 | -0.136 | -0.787 |
| -2.399999999999999 | 0.057 | 0.328 | 1.888 | -0.137 | -0.787 |
| -2.395999999999999 | 0.057 | 0.328 | 1.883 | -0.137 | -0.786 |
| -2.391999999999999 | 0.057 | 0.328 | 1.879 | -0.137 | -0.785 |
| -2.387999999999999 | 0.058 | 0.329 | 1.874 | -0.138 | -0.785 |
| -2.383999999999999 | 0.058 | 0.329 | 1.869 | -0.138 | -0.784 |
| -2.379999999999999 | 0.058 | 0.329 | 1.865 | -0.138 | -0.784 |
| -2.375999999999999 | 0.058 | 0.33 | 1.86 | -0.139 | -0.783 |
| -2.371999999999999 | 0.059 | 0.33 | 1.856 | -0.139 | -0.782 |
| -2.367999999999998 | 0.059 | 0.33 | 1.851 | -0.139 | -0.782 |
| -2.363999999999998 | 0.059 | 0.33 | 1.847 | -0.14 | -0.781 |
| -2.359999999999998 | 0.059 | 0.331 | 1.842 | -0.14 | -0.781 |
| -2.355999999999998 | 0.06 | 0.331 | 1.838 | -0.141 | -0.78 |
| -2.351999999999998 | 0.06 | 0.331 | 1.833 | -0.141 | -0.779 |
| -2.347999999999998 | 0.06 | 0.332 | 1.829 | -0.141 | -0.779 |
| -2.343999999999998 | 0.06 | 0.332 | 1.824 | -0.142 | -0.778 |
| -2.339999999999998 | 0.061 | 0.332 | 1.819 | -0.142 | -0.778 |
| -2.335999999999998 | 0.061 | 0.333 | 1.815 | -0.142 | -0.777 |
| -2.331999999999998 | 0.061 | 0.333 | 1.81 | -0.143 | -0.776 |
| -2.327999999999998 | 0.061 | 0.333 | 1.806 | -0.143 | -0.776 |
| -2.323999999999998 | 0.062 | 0.334 | 1.801 | -0.144 | -0.775 |
| -2.319999999999998 | 0.062 | 0.334 | 1.797 | -0.144 | -0.774 |
| -2.315999999999998 | 0.062 | 0.334 | 1.792 | -0.144 | -0.774 |
| -2.311999999999998 | 0.063 | 0.334 | 1.788 | -0.145 | -0.773 |
| -2.307999999999998 | 0.063 | 0.335 | 1.783 | -0.145 | -0.773 |
| -2.303999999999998 | 0.063 | 0.335 | 1.778 | -0.145 | -0.772 |
| -2.299999999999998 | 0.063 | 0.335 | 1.774 | -0.146 | -0.771 |
| -2.295999999999998 | 0.064 | 0.336 | 1.769 | -0.146 | -0.771 |
| -2.291999999999998 | 0.064 | 0.336 | 1.765 | -0.147 | -0.77 |
| -2.287999999999998 | 0.064 | 0.336 | 1.76 | -0.147 | -0.769 |
| -2.283999999999998 | 0.065 | 0.337 | 1.756 | -0.147 | -0.769 |
| -2.279999999999998 | 0.065 | 0.337 | 1.751 | -0.148 | -0.768 |
| -2.275999999999998 | 0.065 | 0.337 | 1.747 | -0.148 | -0.767 |
| -2.271999999999998 | 0.065 | 0.337 | 1.742 | -0.149 | -0.767 |
| -2.267999999999998 | 0.066 | 0.338 | 1.737 | -0.149 | -0.766 |
| -2.263999999999998 | 0.066 | 0.338 | 1.733 | -0.149 | -0.765 |
| -2.259999999999998 | 0.066 | 0.338 | 1.728 | -0.15 | -0.765 |
| -2.255999999999998 | 0.067 | 0.339 | 1.724 | -0.15 | -0.764 |
| -2.251999999999998 | 0.067 | 0.339 | 1.719 | -0.151 | -0.763 |
| -2.247999999999998 | 0.067 | 0.339 | 1.715 | -0.151 | -0.763 |
| -2.243999999999998 | 0.067 | 0.34 | 1.71 | -0.151 | -0.762 |
| -2.239999999999998 | 0.068 | 0.34 | 1.706 | -0.152 | -0.761 |
| -2.235999999999998 | 0.068 | 0.34 | 1.701 | -0.152 | -0.761 |
| -2.231999999999998 | 0.068 | 0.341 | 1.696 | -0.153 | -0.76 |
| -2.227999999999998 | 0.069 | 0.341 | 1.692 | -0.153 | -0.759 |
| -2.223999999999998 | 0.069 | 0.341 | 1.687 | -0.153 | -0.759 |
| -2.219999999999998 | 0.069 | 0.341 | 1.683 | -0.154 | -0.758 |
| -2.215999999999998 | 0.07 | 0.342 | 1.678 | -0.154 | -0.757 |
| -2.211999999999998 | 0.07 | 0.342 | 1.674 | -0.155 | -0.757 |
| -2.207999999999998 | 0.07 | 0.342 | 1.669 | -0.155 | -0.756 |
| -2.203999999999998 | 0.071 | 0.343 | 1.664 | -0.155 | -0.755 |
| -2.199999999999998 | 0.071 | 0.343 | 1.66 | -0.156 | -0.754 |
| -2.195999999999998 | 0.071 | 0.343 | 1.655 | -0.156 | -0.754 |
| -2.191999999999998 | 0.072 | 0.344 | 1.651 | -0.157 | -0.753 |
| -2.187999999999998 | 0.072 | 0.344 | 1.646 | -0.157 | -0.752 |
| -2.183999999999998 | 0.072 | 0.344 | 1.642 | -0.158 | -0.752 |
| -2.179999999999998 | 0.072 | 0.344 | 1.637 | -0.158 | -0.751 |
| -2.175999999999998 | 0.073 | 0.345 | 1.632 | -0.158 | -0.75 |
| -2.171999999999998 | 0.073 | 0.345 | 1.628 | -0.159 | -0.749 |
| -2.167999999999998 | 0.073 | 0.345 | 1.623 | -0.159 | -0.749 |
| -2.163999999999998 | 0.074 | 0.346 | 1.619 | -0.16 | -0.748 |
| -2.159999999999998 | 0.074 | 0.346 | 1.614 | -0.16 | -0.747 |
| -2.155999999999998 | 0.074 | 0.346 | 1.61 | -0.161 | -0.747 |
| -2.151999999999998 | 0.075 | 0.347 | 1.605 | -0.161 | -0.746 |
| -2.147999999999998 | 0.075 | 0.347 | 1.6 | -0.161 | -0.745 |
| -2.143999999999998 | 0.076 | 0.347 | 1.596 | -0.162 | -0.744 |
| -2.139999999999998 | 0.076 | 0.347 | 1.591 | -0.162 | -0.744 |
| -2.135999999999998 | 0.076 | 0.348 | 1.587 | -0.163 | -0.743 |
| -2.131999999999998 | 0.077 | 0.348 | 1.582 | -0.163 | -0.742 |
| -2.127999999999998 | 0.077 | 0.348 | 1.578 | -0.164 | -0.741 |
| -2.123999999999998 | 0.077 | 0.349 | 1.573 | -0.164 | -0.741 |
| -2.119999999999998 | 0.078 | 0.349 | 1.568 | -0.165 | -0.74 |
| -2.115999999999998 | 0.078 | 0.349 | 1.564 | -0.165 | -0.739 |
| -2.111999999999998 | 0.078 | 0.35 | 1.559 | -0.166 | -0.738 |
| -2.107999999999998 | 0.079 | 0.35 | 1.555 | -0.166 | -0.738 |
| -2.103999999999998 | 0.079 | 0.35 | 1.55 | -0.166 | -0.737 |
| -2.099999999999998 | 0.079 | 0.35 | 1.546 | -0.167 | -0.736 |
| -2.095999999999998 | 0.08 | 0.351 | 1.541 | -0.167 | -0.735 |
| -2.091999999999998 | 0.08 | 0.351 | 1.536 | -0.168 | -0.734 |
| -2.087999999999998 | 0.081 | 0.351 | 1.532 | -0.168 | -0.734 |
| -2.083999999999998 | 0.081 | 0.352 | 1.527 | -0.169 | -0.733 |
| -2.079999999999998 | 0.081 | 0.352 | 1.523 | -0.169 | -0.732 |
| -2.075999999999998 | 0.082 | 0.352 | 1.518 | -0.17 | -0.731 |
| -2.071999999999998 | 0.082 | 0.353 | 1.514 | -0.17 | -0.73 |
| -2.067999999999998 | 0.083 | 0.353 | 1.509 | -0.171 | -0.73 |
| -2.063999999999998 | 0.083 | 0.353 | 1.504 | -0.171 | -0.729 |
| -2.059999999999998 | 0.083 | 0.353 | 1.5 | -0.172 | -0.728 |
| -2.055999999999998 | 0.084 | 0.354 | 1.495 | -0.172 | -0.727 |
| -2.051999999999998 | 0.084 | 0.354 | 1.491 | -0.173 | -0.726 |
| -2.047999999999998 | 0.084 | 0.354 | 1.486 | -0.173 | -0.726 |
| -2.043999999999998 | 0.085 | 0.355 | 1.481 | -0.173 | -0.725 |
| -2.039999999999998 | 0.085 | 0.355 | 1.477 | -0.174 | -0.724 |
| -2.035999999999998 | 0.086 | 0.355 | 1.472 | -0.174 | -0.723 |
| -2.031999999999998 | 0.086 | 0.355 | 1.468 | -0.175 | -0.722 |
| -2.027999999999998 | 0.086 | 0.356 | 1.463 | -0.175 | -0.721 |
| -2.023999999999998 | 0.087 | 0.356 | 1.459 | -0.176 | -0.721 |
| -2.019999999999998 | 0.087 | 0.356 | 1.454 | -0.176 | -0.72 |
| -2.015999999999998 | 0.088 | 0.357 | 1.449 | -0.177 | -0.719 |
| -2.011999999999998 | 0.088 | 0.357 | 1.445 | -0.177 | -0.718 |
| -2.007999999999998 | 0.089 | 0.357 | 1.44 | -0.178 | -0.717 |
| -2.003999999999998 | 0.089 | 0.357 | 1.436 | -0.178 | -0.716 |
| -1.999999999999998 | 0.089 | 0.358 | 1.431 | -0.179 | -0.716 |
| -1.995999999999998 | 0.09 | 0.358 | 1.427 | -0.179 | -0.715 |
| -1.991999999999998 | 0.09 | 0.358 | 1.422 | -0.18 | -0.714 |
| -1.987999999999998 | 0.091 | 0.359 | 1.417 | -0.18 | -0.713 |
| -1.983999999999998 | 0.091 | 0.359 | 1.413 | -0.181 | -0.712 |
| -1.979999999999998 | 0.092 | 0.359 | 1.408 | -0.181 | -0.711 |
| -1.975999999999998 | 0.092 | 0.359 | 1.404 | -0.182 | -0.71 |
| -1.971999999999998 | 0.093 | 0.36 | 1.399 | -0.182 | -0.709 |
| -1.967999999999998 | 0.093 | 0.36 | 1.394 | -0.183 | -0.709 |
| -1.963999999999998 | 0.093 | 0.36 | 1.39 | -0.183 | -0.708 |
| -1.959999999999998 | 0.094 | 0.361 | 1.385 | -0.184 | -0.707 |
| -1.955999999999998 | 0.094 | 0.361 | 1.381 | -0.185 | -0.706 |
| -1.951999999999998 | 0.095 | 0.361 | 1.376 | -0.185 | -0.705 |
| -1.947999999999998 | 0.095 | 0.361 | 1.372 | -0.186 | -0.704 |
| -1.943999999999998 | 0.096 | 0.362 | 1.367 | -0.186 | -0.703 |
| -1.939999999999998 | 0.096 | 0.362 | 1.362 | -0.187 | -0.702 |
| -1.935999999999998 | 0.097 | 0.362 | 1.358 | -0.187 | -0.701 |
| -1.931999999999998 | 0.097 | 0.363 | 1.353 | -0.188 | -0.7 |
| -1.927999999999998 | 0.098 | 0.363 | 1.349 | -0.188 | -0.7 |
| -1.923999999999998 | 0.098 | 0.363 | 1.344 | -0.189 | -0.699 |
| -1.919999999999998 | 0.099 | 0.363 | 1.34 | -0.189 | -0.698 |
| -1.915999999999998 | 0.099 | 0.364 | 1.335 | -0.19 | -0.697 |
| -1.911999999999998 | 0.1 | 0.364 | 1.33 | -0.19 | -0.696 |
| -1.907999999999998 | 0.1 | 0.364 | 1.326 | -0.191 | -0.695 |
| -1.903999999999998 | 0.101 | 0.364 | 1.321 | -0.191 | -0.694 |
| -1.899999999999998 | 0.101 | 0.365 | 1.317 | -0.192 | -0.693 |
| -1.895999999999998 | 0.102 | 0.365 | 1.312 | -0.193 | -0.692 |
| -1.891999999999998 | 0.102 | 0.365 | 1.307 | -0.193 | -0.691 |
| -1.887999999999998 | 0.103 | 0.366 | 1.303 | -0.194 | -0.69 |
| -1.883999999999998 | 0.103 | 0.366 | 1.298 | -0.194 | -0.689 |
| -1.879999999999998 | 0.104 | 0.366 | 1.294 | -0.195 | -0.688 |
| -1.875999999999998 | 0.104 | 0.366 | 1.289 | -0.195 | -0.687 |
| -1.871999999999998 | 0.105 | 0.367 | 1.285 | -0.196 | -0.686 |
| -1.867999999999998 | 0.105 | 0.367 | 1.28 | -0.196 | -0.685 |
| -1.863999999999998 | 0.106 | 0.367 | 1.275 | -0.197 | -0.684 |
| -1.859999999999998 | 0.106 | 0.367 | 1.271 | -0.198 | -0.683 |
| -1.855999999999998 | 0.107 | 0.368 | 1.266 | -0.198 | -0.682 |
| -1.851999999999998 | 0.107 | 0.368 | 1.262 | -0.199 | -0.681 |
| -1.847999999999998 | 0.108 | 0.368 | 1.257 | -0.199 | -0.68 |
| -1.843999999999998 | 0.108 | 0.368 | 1.253 | -0.2 | -0.679 |
| -1.839999999999998 | 0.109 | 0.369 | 1.248 | -0.2 | -0.678 |
| -1.835999999999998 | 0.109 | 0.369 | 1.243 | -0.201 | -0.677 |
| -1.831999999999998 | 0.11 | 0.369 | 1.239 | -0.201 | -0.676 |
| -1.827999999999998 | 0.111 | 0.369 | 1.234 | -0.202 | -0.675 |
| -1.823999999999998 | 0.111 | 0.37 | 1.23 | -0.203 | -0.674 |
| -1.819999999999998 | 0.112 | 0.37 | 1.225 | -0.203 | -0.673 |
| -1.815999999999998 | 0.112 | 0.37 | 1.221 | -0.204 | -0.672 |
| -1.811999999999998 | 0.113 | 0.37 | 1.216 | -0.204 | -0.671 |
| -1.807999999999998 | 0.113 | 0.371 | 1.212 | -0.205 | -0.67 |
| -1.803999999999998 | 0.114 | 0.371 | 1.207 | -0.206 | -0.669 |
| -1.799999999999998 | 0.115 | 0.371 | 1.202 | -0.206 | -0.668 |
| -1.795999999999998 | 0.115 | 0.371 | 1.198 | -0.207 | -0.667 |
| -1.791999999999998 | 0.116 | 0.372 | 1.193 | -0.207 | -0.666 |
| -1.787999999999998 | 0.116 | 0.372 | 1.189 | -0.208 | -0.665 |
| -1.783999999999998 | 0.117 | 0.372 | 1.184 | -0.209 | -0.664 |
| -1.779999999999998 | 0.118 | 0.372 | 1.18 | -0.209 | -0.663 |
| -1.775999999999998 | 0.118 | 0.373 | 1.175 | -0.21 | -0.662 |
| -1.771999999999998 | 0.119 | 0.373 | 1.17 | -0.21 | -0.661 |
| -1.767999999999998 | 0.119 | 0.373 | 1.166 | -0.211 | -0.659 |
| -1.763999999999998 | 0.12 | 0.373 | 1.161 | -0.212 | -0.658 |
| -1.759999999999998 | 0.121 | 0.373 | 1.157 | -0.212 | -0.657 |
| -1.755999999999998 | 0.121 | 0.374 | 1.152 | -0.213 | -0.656 |
| -1.751999999999998 | 0.122 | 0.374 | 1.148 | -0.213 | -0.655 |
| -1.747999999999998 | 0.122 | 0.374 | 1.143 | -0.214 | -0.654 |
| -1.743999999999998 | 0.123 | 0.374 | 1.139 | -0.215 | -0.653 |
| -1.739999999999998 | 0.124 | 0.375 | 1.134 | -0.215 | -0.652 |
| -1.735999999999998 | 0.124 | 0.375 | 1.129 | -0.216 | -0.651 |
| -1.731999999999998 | 0.125 | 0.375 | 1.125 | -0.217 | -0.65 |
| -1.727999999999998 | 0.126 | 0.375 | 1.12 | -0.217 | -0.648 |
| -1.723999999999998 | 0.126 | 0.375 | 1.116 | -0.218 | -0.647 |
| -1.719999999999998 | 0.127 | 0.376 | 1.111 | -0.218 | -0.646 |
| -1.715999999999998 | 0.128 | 0.376 | 1.107 | -0.219 | -0.645 |
| -1.711999999999998 | 0.128 | 0.376 | 1.102 | -0.22 | -0.644 |
| -1.707999999999998 | 0.129 | 0.376 | 1.098 | -0.22 | -0.643 |
| -1.703999999999998 | 0.13 | 0.376 | 1.093 | -0.221 | -0.642 |
| -1.699999999999998 | 0.13 | 0.377 | 1.089 | -0.222 | -0.64 |
| -1.695999999999998 | 0.131 | 0.377 | 1.084 | -0.222 | -0.639 |
| -1.691999999999998 | 0.132 | 0.377 | 1.08 | -0.223 | -0.638 |
| -1.687999999999998 | 0.132 | 0.377 | 1.075 | -0.224 | -0.637 |
| -1.683999999999998 | 0.133 | 0.377 | 1.07 | -0.224 | -0.636 |
| -1.679999999999998 | 0.134 | 0.378 | 1.066 | -0.225 | -0.634 |
| -1.675999999999998 | 0.135 | 0.378 | 1.061 | -0.225 | -0.633 |
| -1.671999999999998 | 0.135 | 0.378 | 1.057 | -0.226 | -0.632 |
| -1.667999999999998 | 0.136 | 0.378 | 1.052 | -0.227 | -0.631 |
| -1.663999999999998 | 0.137 | 0.378 | 1.048 | -0.227 | -0.63 |
| -1.659999999999998 | 0.137 | 0.379 | 1.043 | -0.228 | -0.628 |
| -1.655999999999998 | 0.138 | 0.379 | 1.039 | -0.229 | -0.627 |
| -1.651999999999998 | 0.139 | 0.379 | 1.034 | -0.229 | -0.626 |
| -1.647999999999998 | 0.14 | 0.379 | 1.03 | -0.23 | -0.625 |
| -1.643999999999998 | 0.14 | 0.379 | 1.025 | -0.231 | -0.624 |
| -1.639999999999998 | 0.141 | 0.38 | 1.021 | -0.231 | -0.622 |
| -1.635999999999998 | 0.142 | 0.38 | 1.016 | -0.232 | -0.621 |
| -1.631999999999998 | 0.143 | 0.38 | 1.012 | -0.233 | -0.62 |
| -1.627999999999998 | 0.143 | 0.38 | 1.007 | -0.233 | -0.619 |
| -1.623999999999998 | 0.144 | 0.38 | 1.003 | -0.234 | -0.617 |
| -1.619999999999998 | 0.145 | 0.38 | 0.998 | -0.235 | -0.616 |
| -1.615999999999998 | 0.146 | 0.381 | 0.994 | -0.235 | -0.615 |
| -1.611999999999998 | 0.146 | 0.381 | 0.989 | -0.236 | -0.614 |
| -1.607999999999998 | 0.147 | 0.381 | 0.985 | -0.237 | -0.612 |
| -1.603999999999998 | 0.148 | 0.381 | 0.98 | -0.238 | -0.611 |
| -1.599999999999998 | 0.149 | 0.381 | 0.976 | -0.238 | -0.61 |
| -1.595999999999998 | 0.15 | 0.381 | 0.971 | -0.239 | -0.609 |
| -1.591999999999998 | 0.15 | 0.381 | 0.967 | -0.24 | -0.607 |
| -1.587999999999998 | 0.151 | 0.382 | 0.962 | -0.24 | -0.606 |
| -1.583999999999998 | 0.152 | 0.382 | 0.958 | -0.241 | -0.605 |
| -1.579999999999998 | 0.153 | 0.382 | 0.953 | -0.242 | -0.603 |
| -1.575999999999998 | 0.154 | 0.382 | 0.949 | -0.242 | -0.602 |
| -1.571999999999998 | 0.155 | 0.382 | 0.944 | -0.243 | -0.601 |
| -1.567999999999998 | 0.155 | 0.382 | 0.94 | -0.244 | -0.599 |
| -1.563999999999998 | 0.156 | 0.382 | 0.935 | -0.244 | -0.598 |
| -1.559999999999998 | 0.157 | 0.382 | 0.931 | -0.245 | -0.597 |
| -1.555999999999998 | 0.158 | 0.383 | 0.926 | -0.246 | -0.595 |
| -1.551999999999998 | 0.159 | 0.383 | 0.922 | -0.247 | -0.594 |
| -1.547999999999998 | 0.16 | 0.383 | 0.917 | -0.247 | -0.593 |
| -1.543999999999998 | 0.161 | 0.383 | 0.913 | -0.248 | -0.591 |
| -1.539999999999998 | 0.162 | 0.383 | 0.909 | -0.249 | -0.59 |
| -1.535999999999998 | 0.162 | 0.383 | 0.904 | -0.249 | -0.589 |
| -1.531999999999998 | 0.163 | 0.383 | 0.9 | -0.25 | -0.587 |
| -1.527999999999998 | 0.164 | 0.383 | 0.895 | -0.251 | -0.586 |
| -1.523999999999998 | 0.165 | 0.383 | 0.891 | -0.252 | -0.584 |
| -1.519999999999998 | 0.166 | 0.384 | 0.886 | -0.252 | -0.583 |
| -1.515999999999998 | 0.167 | 0.384 | 0.882 | -0.253 | -0.582 |
| -1.511999999999998 | 0.168 | 0.384 | 0.877 | -0.254 | -0.58 |
| -1.507999999999998 | 0.169 | 0.384 | 0.873 | -0.255 | -0.579 |
| -1.503999999999998 | 0.17 | 0.384 | 0.868 | -0.255 | -0.577 |
| -1.499999999999998 | 0.171 | 0.384 | 0.864 | -0.256 | -0.576 |
| -1.495999999999998 | 0.172 | 0.384 | 0.86 | -0.257 | -0.575 |
| -1.491999999999998 | 0.173 | 0.384 | 0.855 | -0.257 | -0.573 |
| -1.487999999999998 | 0.174 | 0.384 | 0.851 | -0.258 | -0.572 |
| -1.483999999999998 | 0.175 | 0.384 | 0.846 | -0.259 | -0.57 |
| -1.479999999999998 | 0.175 | 0.384 | 0.842 | -0.26 | -0.569 |
| -1.475999999999998 | 0.176 | 0.384 | 0.838 | -0.26 | -0.567 |
| -1.471999999999998 | 0.177 | 0.384 | 0.833 | -0.261 | -0.566 |
| -1.467999999999998 | 0.178 | 0.385 | 0.829 | -0.262 | -0.565 |
| -1.463999999999998 | 0.179 | 0.385 | 0.824 | -0.263 | -0.563 |
| -1.459999999999998 | 0.18 | 0.385 | 0.82 | -0.263 | -0.562 |
| -1.455999999999998 | 0.181 | 0.385 | 0.816 | -0.264 | -0.56 |
| -1.451999999999998 | 0.182 | 0.385 | 0.811 | -0.265 | -0.559 |
| -1.447999999999998 | 0.184 | 0.385 | 0.807 | -0.266 | -0.557 |
| -1.443999999999998 | 0.185 | 0.385 | 0.802 | -0.266 | -0.556 |
| -1.439999999999998 | 0.186 | 0.385 | 0.798 | -0.267 | -0.554 |
| -1.435999999999998 | 0.187 | 0.385 | 0.794 | -0.268 | -0.553 |
| -1.431999999999998 | 0.188 | 0.385 | 0.789 | -0.269 | -0.551 |
| -1.427999999999998 | 0.189 | 0.385 | 0.785 | -0.27 | -0.55 |
| -1.423999999999998 | 0.19 | 0.385 | 0.78 | -0.27 | -0.548 |
| -1.419999999999998 | 0.191 | 0.385 | 0.776 | -0.271 | -0.547 |
| -1.415999999999998 | 0.192 | 0.385 | 0.772 | -0.272 | -0.545 |
| -1.411999999999998 | 0.193 | 0.385 | 0.767 | -0.273 | -0.543 |
| -1.407999999999998 | 0.194 | 0.385 | 0.763 | -0.273 | -0.542 |
| -1.403999999999998 | 0.195 | 0.385 | 0.759 | -0.274 | -0.54 |
| -1.399999999999998 | 0.196 | 0.385 | 0.754 | -0.275 | -0.539 |
| -1.395999999999998 | 0.197 | 0.385 | 0.75 | -0.276 | -0.537 |
| -1.391999999999998 | 0.199 | 0.385 | 0.746 | -0.276 | -0.536 |
| -1.387999999999998 | 0.2 | 0.385 | 0.741 | -0.277 | -0.534 |
| -1.383999999999998 | 0.201 | 0.385 | 0.737 | -0.278 | -0.533 |
| -1.379999999999998 | 0.202 | 0.385 | 0.733 | -0.279 | -0.531 |
| -1.375999999999998 | 0.203 | 0.385 | 0.728 | -0.28 | -0.529 |
| -1.371999999999998 | 0.204 | 0.385 | 0.724 | -0.28 | -0.528 |
| -1.367999999999998 | 0.206 | 0.385 | 0.72 | -0.281 | -0.526 |
| -1.363999999999998 | 0.207 | 0.385 | 0.715 | -0.282 | -0.525 |
| -1.359999999999998 | 0.208 | 0.385 | 0.711 | -0.283 | -0.523 |
| -1.355999999999998 | 0.209 | 0.384 | 0.707 | -0.284 | -0.521 |
| -1.351999999999998 | 0.21 | 0.384 | 0.703 | -0.284 | -0.52 |
| -1.347999999999998 | 0.211 | 0.384 | 0.698 | -0.285 | -0.518 |
| -1.343999999999998 | 0.213 | 0.384 | 0.694 | -0.286 | -0.516 |
| -1.339999999999998 | 0.214 | 0.384 | 0.69 | -0.287 | -0.515 |
| -1.335999999999998 | 0.215 | 0.384 | 0.686 | -0.287 | -0.513 |
| -1.331999999999998 | 0.216 | 0.384 | 0.681 | -0.288 | -0.511 |
| -1.327999999999998 | 0.218 | 0.384 | 0.677 | -0.289 | -0.51 |
| -1.323999999999998 | 0.219 | 0.384 | 0.673 | -0.29 | -0.508 |
| -1.319999999999998 | 0.22 | 0.384 | 0.668 | -0.291 | -0.506 |
| -1.315999999999998 | 0.221 | 0.384 | 0.664 | -0.291 | -0.505 |
| -1.311999999999998 | 0.223 | 0.383 | 0.66 | -0.292 | -0.503 |
| -1.307999999999998 | 0.224 | 0.383 | 0.656 | -0.293 | -0.501 |
| -1.303999999999998 | 0.225 | 0.383 | 0.652 | -0.294 | -0.5 |
| -1.299999999999998 | 0.227 | 0.383 | 0.647 | -0.295 | -0.498 |
| -1.295999999999998 | 0.228 | 0.383 | 0.643 | -0.295 | -0.496 |
| -1.291999999999998 | 0.229 | 0.383 | 0.639 | -0.296 | -0.495 |
| -1.287999999999998 | 0.231 | 0.383 | 0.635 | -0.297 | -0.493 |
| -1.283999999999998 | 0.232 | 0.382 | 0.631 | -0.298 | -0.491 |
| -1.279999999999998 | 0.233 | 0.382 | 0.626 | -0.299 | -0.489 |
| -1.275999999999998 | 0.235 | 0.382 | 0.622 | -0.299 | -0.488 |
| -1.271999999999998 | 0.236 | 0.382 | 0.618 | -0.3 | -0.486 |
| -1.267999999999998 | 0.237 | 0.382 | 0.614 | -0.301 | -0.484 |
| -1.263999999999998 | 0.239 | 0.382 | 0.61 | -0.302 | -0.482 |
| -1.259999999999998 | 0.24 | 0.381 | 0.606 | -0.303 | -0.481 |
| -1.255999999999998 | 0.242 | 0.381 | 0.601 | -0.304 | -0.479 |
| -1.251999999999998 | 0.243 | 0.381 | 0.597 | -0.304 | -0.477 |
| -1.247999999999998 | 0.244 | 0.381 | 0.593 | -0.305 | -0.475 |
| -1.243999999999998 | 0.246 | 0.381 | 0.589 | -0.306 | -0.473 |
| -1.239999999999998 | 0.247 | 0.38 | 0.585 | -0.307 | -0.472 |
| -1.235999999999998 | 0.249 | 0.38 | 0.581 | -0.308 | -0.47 |
| -1.231999999999998 | 0.25 | 0.38 | 0.577 | -0.308 | -0.468 |
| -1.227999999999998 | 0.252 | 0.38 | 0.573 | -0.309 | -0.466 |
| -1.223999999999998 | 0.253 | 0.379 | 0.568 | -0.31 | -0.464 |
| -1.219999999999998 | 0.255 | 0.379 | 0.564 | -0.311 | -0.463 |
| -1.215999999999998 | 0.256 | 0.379 | 0.56 | -0.312 | -0.461 |
| -1.211999999999998 | 0.258 | 0.379 | 0.556 | -0.312 | -0.459 |
| -1.207999999999998 | 0.259 | 0.378 | 0.552 | -0.313 | -0.457 |
| -1.203999999999998 | 0.261 | 0.378 | 0.548 | -0.314 | -0.455 |
| -1.199999999999997 | 0.262 | 0.378 | 0.544 | -0.315 | -0.453 |
| -1.195999999999997 | 0.264 | 0.378 | 0.54 | -0.316 | -0.452 |
| -1.191999999999997 | 0.265 | 0.377 | 0.536 | -0.316 | -0.45 |
| -1.187999999999997 | 0.267 | 0.377 | 0.532 | -0.317 | -0.448 |
| -1.183999999999997 | 0.269 | 0.377 | 0.528 | -0.318 | -0.446 |
| -1.179999999999997 | 0.27 | 0.376 | 0.524 | -0.319 | -0.444 |
| -1.175999999999997 | 0.272 | 0.376 | 0.52 | -0.32 | -0.442 |
| -1.171999999999997 | 0.273 | 0.376 | 0.516 | -0.32 | -0.44 |
| -1.167999999999997 | 0.275 | 0.375 | 0.512 | -0.321 | -0.438 |
| -1.163999999999997 | 0.277 | 0.375 | 0.508 | -0.322 | -0.436 |
| -1.159999999999997 | 0.278 | 0.375 | 0.504 | -0.323 | -0.435 |
| -1.155999999999997 | 0.28 | 0.374 | 0.5 | -0.324 | -0.433 |
| -1.151999999999997 | 0.282 | 0.374 | 0.496 | -0.325 | -0.431 |
| -1.147999999999997 | 0.283 | 0.373 | 0.492 | -0.325 | -0.429 |
| -1.143999999999997 | 0.285 | 0.373 | 0.488 | -0.326 | -0.427 |
| -1.139999999999997 | 0.287 | 0.373 | 0.484 | -0.327 | -0.425 |
| -1.135999999999997 | 0.288 | 0.372 | 0.48 | -0.328 | -0.423 |
| -1.131999999999997 | 0.29 | 0.372 | 0.477 | -0.329 | -0.421 |
| -1.127999999999997 | 0.292 | 0.371 | 0.473 | -0.329 | -0.419 |
| -1.123999999999997 | 0.294 | 0.371 | 0.469 | -0.33 | -0.417 |
| -1.119999999999997 | 0.295 | 0.371 | 0.465 | -0.331 | -0.415 |
| -1.115999999999997 | 0.297 | 0.37 | 0.461 | -0.332 | -0.413 |
| -1.111999999999997 | 0.299 | 0.37 | 0.457 | -0.332 | -0.411 |
| -1.107999999999997 | 0.301 | 0.369 | 0.453 | -0.333 | -0.409 |
| -1.103999999999997 | 0.303 | 0.369 | 0.449 | -0.334 | -0.407 |
| -1.099999999999997 | 0.304 | 0.368 | 0.446 | -0.335 | -0.405 |
| -1.095999999999997 | 0.306 | 0.368 | 0.442 | -0.336 | -0.403 |
| -1.091999999999997 | 0.308 | 0.367 | 0.438 | -0.336 | -0.401 |
| -1.087999999999997 | 0.31 | 0.367 | 0.434 | -0.337 | -0.399 |
| -1.083999999999997 | 0.312 | 0.366 | 0.43 | -0.338 | -0.397 |
| -1.079999999999997 | 0.314 | 0.366 | 0.427 | -0.339 | -0.395 |
| -1.075999999999997 | 0.315 | 0.365 | 0.423 | -0.339 | -0.393 |
| -1.071999999999997 | 0.317 | 0.365 | 0.419 | -0.34 | -0.391 |
| -1.067999999999997 | 0.319 | 0.364 | 0.415 | -0.341 | -0.389 |
| -1.063999999999997 | 0.321 | 0.364 | 0.412 | -0.342 | -0.387 |
| -1.059999999999997 | 0.323 | 0.363 | 0.408 | -0.343 | -0.385 |
| -1.055999999999997 | 0.325 | 0.363 | 0.404 | -0.343 | -0.383 |
| -1.051999999999997 | 0.327 | 0.362 | 0.401 | -0.344 | -0.381 |
| -1.047999999999997 | 0.329 | 0.361 | 0.397 | -0.345 | -0.379 |
| -1.043999999999997 | 0.331 | 0.361 | 0.393 | -0.346 | -0.377 |
| -1.039999999999997 | 0.333 | 0.36 | 0.39 | -0.346 | -0.375 |
| -1.035999999999997 | 0.335 | 0.36 | 0.386 | -0.347 | -0.372 |
| -1.031999999999997 | 0.337 | 0.359 | 0.382 | -0.348 | -0.37 |
| -1.027999999999997 | 0.339 | 0.358 | 0.379 | -0.349 | -0.368 |
| -1.023999999999997 | 0.341 | 0.358 | 0.375 | -0.349 | -0.366 |
| -1.019999999999997 | 0.343 | 0.357 | 0.371 | -0.35 | -0.364 |
| -1.015999999999997 | 0.345 | 0.356 | 0.368 | -0.351 | -0.362 |
| -1.011999999999997 | 0.347 | 0.356 | 0.364 | -0.351 | -0.36 |
| -1.007999999999997 | 0.349 | 0.355 | 0.361 | -0.352 | -0.358 |
| -1.003999999999997 | 0.351 | 0.354 | 0.357 | -0.353 | -0.356 |
| -0.999999999999997 | 0.354 | 0.354 | 0.354 | -0.354 | -0.354 |
| -0.995999999999997 | 0.356 | 0.353 | 0.35 | -0.354 | -0.351 |
| -0.991999999999997 | 0.358 | 0.352 | 0.347 | -0.355 | -0.349 |
| -0.987999999999997 | 0.36 | 0.351 | 0.343 | -0.356 | -0.347 |
| -0.983999999999997 | 0.362 | 0.351 | 0.34 | -0.356 | -0.345 |
| -0.979999999999997 | 0.364 | 0.35 | 0.336 | -0.357 | -0.343 |
| -0.975999999999997 | 0.367 | 0.349 | 0.333 | -0.358 | -0.341 |
| -0.971999999999997 | 0.369 | 0.348 | 0.329 | -0.358 | -0.339 |
| -0.967999999999997 | 0.371 | 0.348 | 0.326 | -0.359 | -0.336 |
| -0.963999999999997 | 0.373 | 0.347 | 0.322 | -0.36 | -0.334 |
| -0.959999999999997 | 0.375 | 0.346 | 0.319 | -0.36 | -0.332 |
| -0.955999999999997 | 0.378 | 0.345 | 0.315 | -0.361 | -0.33 |
| -0.951999999999997 | 0.38 | 0.344 | 0.312 | -0.362 | -0.328 |
| -0.947999999999997 | 0.382 | 0.344 | 0.309 | -0.362 | -0.326 |
| -0.943999999999997 | 0.385 | 0.343 | 0.305 | -0.363 | -0.323 |
| -0.939999999999997 | 0.387 | 0.342 | 0.302 | -0.364 | -0.321 |
| -0.935999999999997 | 0.389 | 0.341 | 0.299 | -0.364 | -0.319 |
| -0.931999999999997 | 0.391 | 0.34 | 0.295 | -0.365 | -0.317 |
| -0.927999999999997 | 0.394 | 0.339 | 0.292 | -0.365 | -0.315 |
| -0.923999999999997 | 0.396 | 0.338 | 0.289 | -0.366 | -0.313 |
| -0.919999999999997 | 0.399 | 0.337 | 0.286 | -0.367 | -0.31 |
| -0.915999999999997 | 0.401 | 0.336 | 0.282 | -0.367 | -0.308 |
| -0.911999999999997 | 0.403 | 0.335 | 0.279 | -0.368 | -0.306 |
| -0.907999999999997 | 0.406 | 0.335 | 0.276 | -0.368 | -0.304 |
| -0.903999999999997 | 0.408 | 0.334 | 0.273 | -0.369 | -0.302 |
| -0.899999999999997 | 0.411 | 0.333 | 0.269 | -0.37 | -0.299 |
| -0.895999999999997 | 0.413 | 0.332 | 0.266 | -0.37 | -0.297 |
| -0.891999999999997 | 0.416 | 0.331 | 0.263 | -0.371 | -0.295 |
| -0.887999999999997 | 0.418 | 0.33 | 0.26 | -0.371 | -0.293 |
| -0.883999999999997 | 0.421 | 0.329 | 0.257 | -0.372 | -0.291 |
| -0.879999999999997 | 0.423 | 0.328 | 0.254 | -0.372 | -0.288 |
| -0.875999999999997 | 0.426 | 0.327 | 0.251 | -0.373 | -0.286 |
| -0.871999999999997 | 0.428 | 0.326 | 0.248 | -0.373 | -0.284 |
| -0.867999999999997 | 0.431 | 0.324 | 0.244 | -0.374 | -0.282 |
| -0.863999999999997 | 0.433 | 0.323 | 0.241 | -0.374 | -0.279 |
| -0.859999999999997 | 0.436 | 0.322 | 0.238 | -0.375 | -0.277 |
| -0.855999999999997 | 0.438 | 0.321 | 0.235 | -0.375 | -0.275 |
| -0.851999999999997 | 0.441 | 0.32 | 0.232 | -0.376 | -0.273 |
| -0.847999999999997 | 0.444 | 0.319 | 0.229 | -0.376 | -0.271 |
| -0.843999999999997 | 0.446 | 0.318 | 0.226 | -0.377 | -0.268 |
| -0.839999999999997 | 0.449 | 0.317 | 0.224 | -0.377 | -0.266 |
| -0.835999999999997 | 0.452 | 0.316 | 0.221 | -0.378 | -0.264 |
| -0.831999999999997 | 0.454 | 0.314 | 0.218 | -0.378 | -0.262 |
| -0.827999999999997 | 0.457 | 0.313 | 0.215 | -0.378 | -0.259 |
| -0.823999999999997 | 0.46 | 0.312 | 0.212 | -0.379 | -0.257 |
| -0.819999999999997 | 0.462 | 0.311 | 0.209 | -0.379 | -0.255 |
| -0.815999999999997 | 0.465 | 0.31 | 0.206 | -0.38 | -0.253 |
| -0.811999999999997 | 0.468 | 0.308 | 0.203 | -0.38 | -0.25 |
| -0.807999999999997 | 0.471 | 0.307 | 0.201 | -0.38 | -0.248 |
| -0.803999999999997 | 0.473 | 0.306 | 0.198 | -0.381 | -0.246 |
| -0.799999999999997 | 0.476 | 0.305 | 0.195 | -0.381 | -0.244 |
| -0.795999999999997 | 0.479 | 0.303 | 0.192 | -0.381 | -0.242 |
| -0.791999999999997 | 0.482 | 0.302 | 0.19 | -0.382 | -0.239 |
| -0.787999999999997 | 0.485 | 0.301 | 0.187 | -0.382 | -0.237 |
| -0.783999999999997 | 0.487 | 0.3 | 0.184 | -0.382 | -0.235 |
| -0.779999999999997 | 0.49 | 0.298 | 0.181 | -0.382 | -0.233 |
| -0.775999999999997 | 0.493 | 0.297 | 0.179 | -0.383 | -0.23 |
| -0.771999999999997 | 0.496 | 0.296 | 0.176 | -0.383 | -0.228 |
| -0.767999999999997 | 0.499 | 0.294 | 0.174 | -0.383 | -0.226 |
| -0.763999999999997 | 0.502 | 0.293 | 0.171 | -0.383 | -0.224 |
| -0.759999999999997 | 0.505 | 0.291 | 0.168 | -0.384 | -0.222 |
| -0.755999999999997 | 0.508 | 0.29 | 0.166 | -0.384 | -0.219 |
| -0.751999999999997 | 0.511 | 0.289 | 0.163 | -0.384 | -0.217 |
| -0.747999999999997 | 0.513 | 0.287 | 0.161 | -0.384 | -0.215 |
| -0.743999999999997 | 0.516 | 0.286 | 0.158 | -0.384 | -0.213 |
| -0.739999999999997 | 0.519 | 0.284 | 0.156 | -0.384 | -0.21 |
| -0.735999999999997 | 0.522 | 0.283 | 0.153 | -0.384 | -0.208 |
| -0.731999999999997 | 0.525 | 0.282 | 0.151 | -0.385 | -0.206 |
| -0.727999999999997 | 0.528 | 0.28 | 0.148 | -0.385 | -0.204 |
| -0.723999999999997 | 0.531 | 0.279 | 0.146 | -0.385 | -0.202 |
| -0.719999999999997 | 0.534 | 0.277 | 0.144 | -0.385 | -0.199 |
| -0.715999999999997 | 0.538 | 0.276 | 0.141 | -0.385 | -0.197 |
| -0.711999999999997 | 0.541 | 0.274 | 0.139 | -0.385 | -0.195 |
| -0.707999999999997 | 0.544 | 0.273 | 0.137 | -0.385 | -0.193 |
| -0.703999999999997 | 0.547 | 0.271 | 0.134 | -0.385 | -0.191 |
| -0.699999999999997 | 0.55 | 0.269 | 0.132 | -0.385 | -0.189 |
| -0.695999999999997 | 0.553 | 0.268 | 0.13 | -0.385 | -0.186 |
| -0.691999999999997 | 0.556 | 0.266 | 0.128 | -0.385 | -0.184 |
| -0.687999999999997 | 0.559 | 0.265 | 0.125 | -0.385 | -0.182 |
| -0.683999999999997 | 0.562 | 0.263 | 0.123 | -0.385 | -0.18 |
| -0.679999999999997 | 0.565 | 0.261 | 0.121 | -0.385 | -0.178 |
| -0.675999999999997 | 0.569 | 0.26 | 0.119 | -0.384 | -0.176 |
| -0.671999999999997 | 0.572 | 0.258 | 0.117 | -0.384 | -0.174 |
| -0.667999999999997 | 0.575 | 0.257 | 0.114 | -0.384 | -0.171 |
| -0.663999999999997 | 0.578 | 0.255 | 0.112 | -0.384 | -0.169 |
| -0.659999999999997 | 0.581 | 0.253 | 0.11 | -0.384 | -0.167 |
| -0.655999999999997 | 0.585 | 0.252 | 0.108 | -0.383 | -0.165 |
| -0.651999999999997 | 0.588 | 0.25 | 0.106 | -0.383 | -0.163 |
| -0.647999999999997 | 0.591 | 0.248 | 0.104 | -0.383 | -0.161 |
| -0.643999999999997 | 0.594 | 0.246 | 0.102 | -0.383 | -0.159 |
| -0.639999999999997 | 0.598 | 0.245 | 0.1 | -0.382 | -0.157 |
| -0.635999999999997 | 0.601 | 0.243 | 0.098 | -0.382 | -0.155 |
| -0.631999999999997 | 0.604 | 0.241 | 0.096 | -0.382 | -0.152 |
| -0.627999999999997 | 0.607 | 0.24 | 0.094 | -0.381 | -0.15 |
| -0.623999999999997 | 0.611 | 0.238 | 0.093 | -0.381 | -0.148 |
| -0.619999999999997 | 0.614 | 0.236 | 0.091 | -0.381 | -0.146 |
| -0.615999999999997 | 0.617 | 0.234 | 0.089 | -0.38 | -0.144 |
| -0.611999999999997 | 0.621 | 0.232 | 0.087 | -0.38 | -0.142 |
| -0.607999999999997 | 0.624 | 0.231 | 0.085 | -0.379 | -0.14 |
| -0.603999999999997 | 0.627 | 0.229 | 0.083 | -0.379 | -0.138 |
| -0.599999999999997 | 0.631 | 0.227 | 0.082 | -0.378 | -0.136 |
| -0.595999999999997 | 0.634 | 0.225 | 0.08 | -0.378 | -0.134 |
| -0.591999999999997 | 0.637 | 0.223 | 0.078 | -0.377 | -0.132 |
| -0.587999999999997 | 0.641 | 0.221 | 0.077 | -0.377 | -0.13 |
| -0.583999999999997 | 0.644 | 0.22 | 0.075 | -0.376 | -0.128 |
| -0.579999999999997 | 0.647 | 0.218 | 0.073 | -0.375 | -0.126 |
| -0.575999999999997 | 0.651 | 0.216 | 0.072 | -0.375 | -0.124 |
| -0.571999999999997 | 0.654 | 0.214 | 0.07 | -0.374 | -0.122 |
| -0.567999999999997 | 0.657 | 0.212 | 0.068 | -0.373 | -0.12 |
| -0.563999999999997 | 0.661 | 0.21 | 0.067 | -0.373 | -0.119 |
| -0.559999999999997 | 0.664 | 0.208 | 0.065 | -0.372 | -0.117 |
| -0.555999999999997 | 0.668 | 0.206 | 0.064 | -0.371 | -0.115 |
| -0.551999999999997 | 0.671 | 0.204 | 0.062 | -0.37 | -0.113 |
| -0.547999999999997 | 0.674 | 0.203 | 0.061 | -0.37 | -0.111 |
| -0.543999999999997 | 0.678 | 0.201 | 0.059 | -0.369 | -0.109 |
| -0.539999999999997 | 0.681 | 0.199 | 0.058 | -0.368 | -0.107 |
| -0.535999999999997 | 0.685 | 0.197 | 0.057 | -0.367 | -0.105 |
| -0.531999999999997 | 0.688 | 0.195 | 0.055 | -0.366 | -0.104 |
| -0.527999999999997 | 0.692 | 0.193 | 0.054 | -0.365 | -0.102 |
| -0.523999999999997 | 0.695 | 0.191 | 0.052 | -0.364 | -0.1 |
| -0.519999999999997 | 0.698 | 0.189 | 0.051 | -0.363 | -0.098 |
| -0.515999999999997 | 0.702 | 0.187 | 0.05 | -0.362 | -0.096 |
| -0.511999999999997 | 0.705 | 0.185 | 0.048 | -0.361 | -0.095 |
| -0.507999999999997 | 0.709 | 0.183 | 0.047 | -0.36 | -0.093 |
| -0.503999999999997 | 0.712 | 0.181 | 0.046 | -0.359 | -0.091 |
| -0.499999999999997 | 0.716 | 0.179 | 0.045 | -0.358 | -0.089 |
| -0.495999999999997 | 0.719 | 0.177 | 0.044 | -0.357 | -0.088 |
| -0.491999999999997 | 0.722 | 0.175 | 0.042 | -0.355 | -0.086 |
| -0.487999999999997 | 0.726 | 0.173 | 0.041 | -0.354 | -0.084 |
| -0.483999999999997 | 0.729 | 0.171 | 0.04 | -0.353 | -0.083 |
| -0.479999999999997 | 0.733 | 0.169 | 0.039 | -0.352 | -0.081 |
| -0.475999999999997 | 0.736 | 0.167 | 0.038 | -0.35 | -0.079 |
| -0.471999999999997 | 0.74 | 0.165 | 0.037 | -0.349 | -0.078 |
| -0.467999999999997 | 0.743 | 0.163 | 0.036 | -0.348 | -0.076 |
| -0.463999999999997 | 0.746 | 0.161 | 0.035 | -0.346 | -0.075 |
| -0.459999999999997 | 0.75 | 0.159 | 0.034 | -0.345 | -0.073 |
| -0.455999999999997 | 0.753 | 0.157 | 0.033 | -0.343 | -0.071 |
| -0.451999999999997 | 0.757 | 0.155 | 0.032 | -0.342 | -0.07 |
| -0.447999999999997 | 0.76 | 0.153 | 0.031 | -0.341 | -0.068 |
| -0.443999999999997 | 0.763 | 0.151 | 0.03 | -0.339 | -0.067 |
| -0.439999999999997 | 0.767 | 0.148 | 0.029 | -0.337 | -0.065 |
| -0.435999999999997 | 0.77 | 0.146 | 0.028 | -0.336 | -0.064 |
| -0.431999999999997 | 0.774 | 0.144 | 0.027 | -0.334 | -0.062 |
| -0.427999999999997 | 0.777 | 0.142 | 0.026 | -0.333 | -0.061 |
| -0.423999999999997 | 0.78 | 0.14 | 0.025 | -0.331 | -0.059 |
| -0.419999999999997 | 0.784 | 0.138 | 0.024 | -0.329 | -0.058 |
| -0.415999999999997 | 0.787 | 0.136 | 0.024 | -0.327 | -0.057 |
| -0.411999999999997 | 0.79 | 0.134 | 0.023 | -0.326 | -0.055 |
| -0.407999999999997 | 0.794 | 0.132 | 0.022 | -0.324 | -0.054 |
| -0.403999999999997 | 0.797 | 0.13 | 0.021 | -0.322 | -0.053 |
| -0.399999999999997 | 0.8 | 0.128 | 0.02 | -0.32 | -0.051 |
| -0.395999999999997 | 0.804 | 0.126 | 0.02 | -0.318 | -0.05 |
| -0.391999999999997 | 0.807 | 0.124 | 0.019 | -0.316 | -0.049 |
| -0.387999999999997 | 0.81 | 0.122 | 0.018 | -0.314 | -0.047 |
| -0.383999999999997 | 0.814 | 0.12 | 0.018 | -0.312 | -0.046 |
| -0.379999999999997 | 0.817 | 0.118 | 0.017 | -0.31 | -0.045 |
| -0.375999999999997 | 0.82 | 0.116 | 0.016 | -0.308 | -0.044 |
| -0.371999999999997 | 0.823 | 0.114 | 0.016 | -0.306 | -0.042 |
| -0.367999999999997 | 0.827 | 0.112 | 0.015 | -0.304 | -0.041 |
| -0.363999999999997 | 0.83 | 0.11 | 0.015 | -0.302 | -0.04 |
| -0.359999999999997 | 0.833 | 0.108 | 0.014 | -0.3 | -0.039 |
| -0.355999999999997 | 0.836 | 0.106 | 0.013 | -0.298 | -0.038 |
| -0.351999999999997 | 0.839 | 0.104 | 0.013 | -0.295 | -0.037 |
| -0.347999999999997 | 0.842 | 0.102 | 0.012 | -0.293 | -0.036 |
| -0.343999999999997 | 0.846 | 0.1 | 0.012 | -0.291 | -0.034 |
| -0.339999999999997 | 0.849 | 0.098 | 0.011 | -0.289 | -0.033 |
| -0.335999999999997 | 0.852 | 0.096 | 0.011 | -0.286 | -0.032 |
| -0.331999999999997 | 0.855 | 0.094 | 0.01 | -0.284 | -0.031 |
| -0.327999999999997 | 0.858 | 0.092 | 0.01 | -0.281 | -0.03 |
| -0.323999999999997 | 0.861 | 0.09 | 0.009 | -0.279 | -0.029 |
| -0.319999999999997 | 0.864 | 0.088 | 0.009 | -0.276 | -0.028 |
| -0.315999999999997 | 0.867 | 0.087 | 0.009 | -0.274 | -0.027 |
| -0.311999999999997 | 0.87 | 0.085 | 0.008 | -0.271 | -0.026 |
| -0.307999999999997 | 0.873 | 0.083 | 0.008 | -0.269 | -0.026 |
| -0.303999999999997 | 0.876 | 0.081 | 0.007 | -0.266 | -0.025 |
| -0.299999999999997 | 0.879 | 0.079 | 0.007 | -0.264 | -0.024 |
| -0.295999999999997 | 0.882 | 0.077 | 0.007 | -0.261 | -0.023 |
| -0.291999999999997 | 0.884 | 0.075 | 0.006 | -0.258 | -0.022 |
| -0.287999999999997 | 0.887 | 0.074 | 0.006 | -0.256 | -0.021 |
| -0.283999999999997 | 0.89 | 0.072 | 0.006 | -0.253 | -0.02 |
| -0.279999999999997 | 0.893 | 0.07 | 0.005 | -0.25 | -0.02 |
| -0.275999999999997 | 0.896 | 0.068 | 0.005 | -0.247 | -0.019 |
| -0.271999999999997 | 0.898 | 0.066 | 0.005 | -0.244 | -0.018 |
| -0.267999999999997 | 0.901 | 0.065 | 0.005 | -0.242 | -0.017 |
| -0.263999999999997 | 0.904 | 0.063 | 0.004 | -0.239 | -0.017 |
| -0.259999999999997 | 0.907 | 0.061 | 0.004 | -0.236 | -0.016 |
| -0.255999999999997 | 0.909 | 0.06 | 0.004 | -0.233 | -0.015 |
| -0.251999999999997 | 0.912 | 0.058 | 0.004 | -0.23 | -0.015 |
| -0.247999999999997 | 0.914 | 0.056 | 0.003 | -0.227 | -0.014 |
| -0.243999999999997 | 0.917 | 0.055 | 0.003 | -0.224 | -0.013 |
| -0.239999999999997 | 0.919 | 0.053 | 0.003 | -0.221 | -0.013 |
| -0.235999999999997 | 0.922 | 0.051 | 0.003 | -0.218 | -0.012 |
| -0.231999999999997 | 0.924 | 0.05 | 0.003 | -0.214 | -0.012 |
| -0.227999999999997 | 0.927 | 0.048 | 0.003 | -0.211 | -0.011 |
| -0.223999999999997 | 0.929 | 0.047 | 0.002 | -0.208 | -0.01 |
| -0.219999999999997 | 0.932 | 0.045 | 0.002 | -0.205 | -0.01 |
| -0.215999999999997 | 0.934 | 0.044 | 0.002 | -0.202 | -0.009 |
| -0.211999999999997 | 0.936 | 0.042 | 0.002 | -0.198 | -0.009 |
| -0.207999999999997 | 0.938 | 0.041 | 0.002 | -0.195 | -0.008 |
| -0.203999999999997 | 0.941 | 0.039 | 0.002 | -0.192 | -0.008 |
| -0.199999999999997 | 0.943 | 0.038 | 0.002 | -0.189 | -0.008 |
| -0.195999999999997 | 0.945 | 0.036 | 0.001 | -0.185 | -0.007 |
| -0.191999999999997 | 0.947 | 0.035 | 0.001 | -0.182 | -0.007 |
| -0.187999999999997 | 0.949 | 0.034 | 0.001 | -0.178 | -0.006 |
| -0.183999999999997 | 0.951 | 0.032 | 0.001 | -0.175 | -0.006 |
| -0.179999999999997 | 0.953 | 0.031 | 0.001 | -0.172 | -0.006 |
| -0.175999999999997 | 0.955 | 0.03 | 0.001 | -0.168 | -0.005 |
| -0.171999999999997 | 0.957 | 0.028 | 0.001 | -0.165 | -0.005 |
| -0.167999999999997 | 0.959 | 0.027 | 0.001 | -0.161 | -0.005 |
| -0.163999999999997 | 0.961 | 0.026 | 0.001 | -0.158 | -0.004 |
| -0.159999999999997 | 0.963 | 0.025 | 0.001 | -0.154 | -0.004 |
| -0.155999999999997 | 0.965 | 0.023 | 0.001 | -0.15 | -0.004 |
| -0.151999999999997 | 0.966 | 0.022 | 0.001 | -0.147 | -0.003 |
| -0.147999999999997 | 0.968 | 0.021 | 0 | -0.143 | -0.003 |
| -0.143999999999997 | 0.97 | 0.02 | 0 | -0.14 | -0.003 |
| -0.139999999999997 | 0.971 | 0.019 | 0 | -0.136 | -0.003 |
| -0.135999999999997 | 0.973 | 0.018 | 0 | -0.132 | -0.002 |
| -0.131999999999997 | 0.974 | 0.017 | 0 | -0.129 | -0.002 |
| -0.127999999999997 | 0.976 | 0.016 | 0 | -0.125 | -0.002 |
| -0.123999999999997 | 0.977 | 0.015 | 0 | -0.121 | -0.002 |
| -0.119999999999997 | 0.979 | 0.014 | 0 | -0.117 | -0.002 |
| -0.115999999999997 | 0.98 | 0.013 | 0 | -0.114 | -0.002 |
| -0.111999999999997 | 0.981 | 0.012 | 0 | -0.11 | -0.001 |
| -0.107999999999997 | 0.983 | 0.011 | 0 | -0.106 | -0.001 |
| -0.103999999999997 | 0.984 | 0.011 | 0 | -0.102 | -0.001 |
| -0.0999999999999965 | 0.985 | 0.01 | 0 | -0.099 | -0.001 |
| -0.0959999999999965 | 0.986 | 0.009 | 0 | -0.095 | -0.001 |
| -0.0919999999999965 | 0.987 | 0.008 | 0 | -0.091 | -0.001 |
| -0.0879999999999965 | 0.988 | 0.008 | 0 | -0.087 | -0.001 |
| -0.0839999999999965 | 0.99 | 0.007 | 0 | -0.083 | -0.001 |
| -0.0799999999999965 | 0.99 | 0.006 | 0 | -0.079 | -0.001 |
| -0.0759999999999965 | 0.991 | 0.006 | 0 | -0.075 | 0 |
| -0.0719999999999965 | 0.992 | 0.005 | 0 | -0.071 | 0 |
| -0.0679999999999965 | 0.993 | 0.005 | 0 | -0.068 | 0 |
| -0.0639999999999965 | 0.994 | 0.004 | 0 | -0.064 | 0 |
| -0.0599999999999965 | 0.995 | 0.004 | 0 | -0.06 | 0 |
| -0.0559999999999965 | 0.995 | 0.003 | 0 | -0.056 | 0 |
| -0.0519999999999965 | 0.996 | 0.003 | 0 | -0.052 | 0 |
| -0.0479999999999965 | 0.997 | 0.002 | 0 | -0.048 | 0 |
| -0.0439999999999965 | 0.997 | 0.002 | 0 | -0.044 | 0 |
| -0.0399999999999965 | 0.998 | 0.002 | 0 | -0.04 | 0 |
| -0.0359999999999965 | 0.998 | 0.001 | 0 | -0.036 | 0 |
| -0.0319999999999965 | 0.998 | 0.001 | 0 | -0.032 | 0 |
| -0.0279999999999965 | 0.999 | 0.001 | 0 | -0.028 | 0 |
| -0.0239999999999965 | 0.999 | 0.001 | 0 | -0.024 | 0 |
| -0.0199999999999965 | 0.999 | 0 | 0 | -0.02 | 0 |
| -0.0159999999999965 | 1 | 0 | 0 | -0.016 | 0 |
| -0.0119999999999965 | 1 | 0 | 0 | -0.012 | 0 |
| -0.00799999999999647 | 1 | 0 | 0 | -0.008 | 0 |
| -0.00399999999999647 | 1 | 0 | 0 | -0.004 | 0 |
| 3.52495810318487e-15 | 1 | 0 | 0 | 0 | 0 |
| 0.00400000000000352 | 1 | 0 | 0 | 0.004 | 0 |
| 0.00800000000000352 | 1 | 0 | 0 | 0.008 | 0 |
| 0.0120000000000035 | 1 | 0 | 0 | 0.012 | 0 |
| 0.0160000000000035 | 1 | 0 | 0 | 0.016 | 0 |
| 0.0200000000000035 | 0.999 | 0 | 0 | 0.02 | 0 |
| 0.0240000000000035 | 0.999 | 0.001 | 0 | 0.024 | 0 |
| 0.0280000000000035 | 0.999 | 0.001 | 0 | 0.028 | 0 |
| 0.0320000000000035 | 0.998 | 0.001 | 0 | 0.032 | 0 |
| 0.0360000000000035 | 0.998 | 0.001 | 0 | 0.036 | 0 |
| 0.0400000000000035 | 0.998 | 0.002 | 0 | 0.04 | 0 |
| 0.0440000000000035 | 0.997 | 0.002 | 0 | 0.044 | 0 |
| 0.0480000000000035 | 0.997 | 0.002 | 0 | 0.048 | 0 |
| 0.0520000000000035 | 0.996 | 0.003 | 0 | 0.052 | 0 |
| 0.0560000000000035 | 0.995 | 0.003 | 0 | 0.056 | 0 |
| 0.0600000000000035 | 0.995 | 0.004 | 0 | 0.06 | 0 |
| 0.0640000000000035 | 0.994 | 0.004 | 0 | 0.064 | 0 |
| 0.0680000000000035 | 0.993 | 0.005 | 0 | 0.068 | 0 |
| 0.0720000000000036 | 0.992 | 0.005 | 0 | 0.071 | 0 |
| 0.0760000000000036 | 0.991 | 0.006 | 0 | 0.075 | 0 |
| 0.0800000000000036 | 0.99 | 0.006 | 0 | 0.079 | 0.001 |
| 0.0840000000000036 | 0.99 | 0.007 | 0 | 0.083 | 0.001 |
| 0.0880000000000036 | 0.988 | 0.008 | 0 | 0.087 | 0.001 |
| 0.0920000000000036 | 0.987 | 0.008 | 0 | 0.091 | 0.001 |
| 0.0960000000000036 | 0.986 | 0.009 | 0 | 0.095 | 0.001 |
| 0.100000000000004 | 0.985 | 0.01 | 0 | 0.099 | 0.001 |
| 0.104000000000004 | 0.984 | 0.011 | 0 | 0.102 | 0.001 |
| 0.108000000000004 | 0.983 | 0.011 | 0 | 0.106 | 0.001 |
| 0.112000000000004 | 0.981 | 0.012 | 0 | 0.11 | 0.001 |
| 0.116000000000004 | 0.98 | 0.013 | 0 | 0.114 | 0.002 |
| 0.120000000000004 | 0.979 | 0.014 | 0 | 0.117 | 0.002 |
| 0.124000000000004 | 0.977 | 0.015 | 0 | 0.121 | 0.002 |
| 0.128000000000004 | 0.976 | 0.016 | 0 | 0.125 | 0.002 |
| 0.132000000000004 | 0.974 | 0.017 | 0 | 0.129 | 0.002 |
| 0.136000000000004 | 0.973 | 0.018 | 0 | 0.132 | 0.002 |
| 0.140000000000004 | 0.971 | 0.019 | 0 | 0.136 | 0.003 |
| 0.144000000000004 | 0.97 | 0.02 | 0 | 0.14 | 0.003 |
| 0.148000000000004 | 0.968 | 0.021 | 0 | 0.143 | 0.003 |
| 0.152000000000004 | 0.966 | 0.022 | 0.001 | 0.147 | 0.003 |
| 0.156000000000004 | 0.965 | 0.023 | 0.001 | 0.15 | 0.004 |
| 0.160000000000004 | 0.963 | 0.025 | 0.001 | 0.154 | 0.004 |
| 0.164000000000004 | 0.961 | 0.026 | 0.001 | 0.158 | 0.004 |
| 0.168000000000004 | 0.959 | 0.027 | 0.001 | 0.161 | 0.005 |
| 0.172000000000004 | 0.957 | 0.028 | 0.001 | 0.165 | 0.005 |
| 0.176000000000004 | 0.955 | 0.03 | 0.001 | 0.168 | 0.005 |
| 0.180000000000004 | 0.953 | 0.031 | 0.001 | 0.172 | 0.006 |
| 0.184000000000004 | 0.951 | 0.032 | 0.001 | 0.175 | 0.006 |
| 0.188000000000004 | 0.949 | 0.034 | 0.001 | 0.178 | 0.006 |
| 0.192000000000004 | 0.947 | 0.035 | 0.001 | 0.182 | 0.007 |
| 0.196000000000004 | 0.945 | 0.036 | 0.001 | 0.185 | 0.007 |
| 0.200000000000004 | 0.943 | 0.038 | 0.002 | 0.189 | 0.008 |
| 0.204000000000004 | 0.941 | 0.039 | 0.002 | 0.192 | 0.008 |
| 0.208000000000004 | 0.938 | 0.041 | 0.002 | 0.195 | 0.008 |
| 0.212000000000004 | 0.936 | 0.042 | 0.002 | 0.198 | 0.009 |
| 0.216000000000004 | 0.934 | 0.044 | 0.002 | 0.202 | 0.009 |
| 0.220000000000004 | 0.932 | 0.045 | 0.002 | 0.205 | 0.01 |
| 0.224000000000004 | 0.929 | 0.047 | 0.002 | 0.208 | 0.01 |
| 0.228000000000004 | 0.927 | 0.048 | 0.003 | 0.211 | 0.011 |
| 0.232000000000004 | 0.924 | 0.05 | 0.003 | 0.214 | 0.012 |
| 0.236000000000004 | 0.922 | 0.051 | 0.003 | 0.218 | 0.012 |
| 0.240000000000004 | 0.919 | 0.053 | 0.003 | 0.221 | 0.013 |
| 0.244000000000004 | 0.917 | 0.055 | 0.003 | 0.224 | 0.013 |
| 0.248000000000004 | 0.914 | 0.056 | 0.003 | 0.227 | 0.014 |
| 0.252000000000004 | 0.912 | 0.058 | 0.004 | 0.23 | 0.015 |
| 0.256000000000004 | 0.909 | 0.06 | 0.004 | 0.233 | 0.015 |
| 0.260000000000004 | 0.907 | 0.061 | 0.004 | 0.236 | 0.016 |
| 0.264000000000004 | 0.904 | 0.063 | 0.004 | 0.239 | 0.017 |
| 0.268000000000004 | 0.901 | 0.065 | 0.005 | 0.242 | 0.017 |
| 0.272000000000004 | 0.898 | 0.066 | 0.005 | 0.244 | 0.018 |
| 0.276000000000004 | 0.896 | 0.068 | 0.005 | 0.247 | 0.019 |
| 0.280000000000004 | 0.893 | 0.07 | 0.005 | 0.25 | 0.02 |
| 0.284000000000004 | 0.89 | 0.072 | 0.006 | 0.253 | 0.02 |
| 0.288000000000004 | 0.887 | 0.074 | 0.006 | 0.256 | 0.021 |
| 0.292000000000004 | 0.884 | 0.075 | 0.006 | 0.258 | 0.022 |
| 0.296000000000004 | 0.882 | 0.077 | 0.007 | 0.261 | 0.023 |
| 0.300000000000004 | 0.879 | 0.079 | 0.007 | 0.264 | 0.024 |
| 0.304000000000004 | 0.876 | 0.081 | 0.007 | 0.266 | 0.025 |
| 0.308000000000004 | 0.873 | 0.083 | 0.008 | 0.269 | 0.026 |
| 0.312000000000004 | 0.87 | 0.085 | 0.008 | 0.271 | 0.026 |
| 0.316000000000004 | 0.867 | 0.087 | 0.009 | 0.274 | 0.027 |
| 0.320000000000004 | 0.864 | 0.088 | 0.009 | 0.276 | 0.028 |
| 0.324000000000004 | 0.861 | 0.09 | 0.009 | 0.279 | 0.029 |
| 0.328000000000004 | 0.858 | 0.092 | 0.01 | 0.281 | 0.03 |
| 0.332000000000004 | 0.855 | 0.094 | 0.01 | 0.284 | 0.031 |
| 0.336000000000004 | 0.852 | 0.096 | 0.011 | 0.286 | 0.032 |
| 0.340000000000004 | 0.849 | 0.098 | 0.011 | 0.289 | 0.033 |
| 0.344000000000004 | 0.846 | 0.1 | 0.012 | 0.291 | 0.034 |
| 0.348000000000004 | 0.842 | 0.102 | 0.012 | 0.293 | 0.036 |
| 0.352000000000004 | 0.839 | 0.104 | 0.013 | 0.295 | 0.037 |
| 0.356000000000004 | 0.836 | 0.106 | 0.013 | 0.298 | 0.038 |
| 0.360000000000004 | 0.833 | 0.108 | 0.014 | 0.3 | 0.039 |
| 0.364000000000004 | 0.83 | 0.11 | 0.015 | 0.302 | 0.04 |
| 0.368000000000004 | 0.827 | 0.112 | 0.015 | 0.304 | 0.041 |
| 0.372000000000004 | 0.823 | 0.114 | 0.016 | 0.306 | 0.042 |
| 0.376000000000004 | 0.82 | 0.116 | 0.016 | 0.308 | 0.044 |
| 0.380000000000004 | 0.817 | 0.118 | 0.017 | 0.31 | 0.045 |
| 0.384000000000004 | 0.814 | 0.12 | 0.018 | 0.312 | 0.046 |
| 0.388000000000004 | 0.81 | 0.122 | 0.018 | 0.314 | 0.047 |
| 0.392000000000004 | 0.807 | 0.124 | 0.019 | 0.316 | 0.049 |
| 0.396000000000004 | 0.804 | 0.126 | 0.02 | 0.318 | 0.05 |
| 0.400000000000004 | 0.8 | 0.128 | 0.02 | 0.32 | 0.051 |
| 0.404000000000004 | 0.797 | 0.13 | 0.021 | 0.322 | 0.053 |
| 0.408000000000004 | 0.794 | 0.132 | 0.022 | 0.324 | 0.054 |
| 0.412000000000004 | 0.79 | 0.134 | 0.023 | 0.326 | 0.055 |
| 0.416000000000004 | 0.787 | 0.136 | 0.024 | 0.327 | 0.057 |
| 0.420000000000004 | 0.784 | 0.138 | 0.024 | 0.329 | 0.058 |
| 0.424000000000004 | 0.78 | 0.14 | 0.025 | 0.331 | 0.059 |
| 0.428000000000004 | 0.777 | 0.142 | 0.026 | 0.333 | 0.061 |
| 0.432000000000004 | 0.774 | 0.144 | 0.027 | 0.334 | 0.062 |
| 0.436000000000004 | 0.77 | 0.146 | 0.028 | 0.336 | 0.064 |
| 0.440000000000004 | 0.767 | 0.148 | 0.029 | 0.337 | 0.065 |
| 0.444000000000004 | 0.763 | 0.151 | 0.03 | 0.339 | 0.067 |
| 0.448000000000004 | 0.76 | 0.153 | 0.031 | 0.341 | 0.068 |
| 0.452000000000004 | 0.757 | 0.155 | 0.032 | 0.342 | 0.07 |
| 0.456000000000004 | 0.753 | 0.157 | 0.033 | 0.343 | 0.071 |
| 0.460000000000004 | 0.75 | 0.159 | 0.034 | 0.345 | 0.073 |
| 0.464000000000004 | 0.746 | 0.161 | 0.035 | 0.346 | 0.075 |
| 0.468000000000004 | 0.743 | 0.163 | 0.036 | 0.348 | 0.076 |
| 0.472000000000004 | 0.74 | 0.165 | 0.037 | 0.349 | 0.078 |
| 0.476000000000004 | 0.736 | 0.167 | 0.038 | 0.35 | 0.079 |
| 0.480000000000004 | 0.733 | 0.169 | 0.039 | 0.352 | 0.081 |
| 0.484000000000004 | 0.729 | 0.171 | 0.04 | 0.353 | 0.083 |
| 0.488000000000004 | 0.726 | 0.173 | 0.041 | 0.354 | 0.084 |
| 0.492000000000004 | 0.722 | 0.175 | 0.042 | 0.355 | 0.086 |
| 0.496000000000004 | 0.719 | 0.177 | 0.044 | 0.357 | 0.088 |
| 0.500000000000004 | 0.716 | 0.179 | 0.045 | 0.358 | 0.089 |
| 0.504000000000004 | 0.712 | 0.181 | 0.046 | 0.359 | 0.091 |
| 0.508000000000004 | 0.709 | 0.183 | 0.047 | 0.36 | 0.093 |
| 0.512000000000004 | 0.705 | 0.185 | 0.048 | 0.361 | 0.095 |
| 0.516000000000004 | 0.702 | 0.187 | 0.05 | 0.362 | 0.096 |
| 0.520000000000004 | 0.698 | 0.189 | 0.051 | 0.363 | 0.098 |
| 0.524000000000004 | 0.695 | 0.191 | 0.052 | 0.364 | 0.1 |
| 0.528000000000004 | 0.692 | 0.193 | 0.054 | 0.365 | 0.102 |
| 0.532000000000004 | 0.688 | 0.195 | 0.055 | 0.366 | 0.104 |
| 0.536000000000004 | 0.685 | 0.197 | 0.057 | 0.367 | 0.105 |
| 0.540000000000004 | 0.681 | 0.199 | 0.058 | 0.368 | 0.107 |
| 0.544000000000004 | 0.678 | 0.201 | 0.059 | 0.369 | 0.109 |
| 0.548000000000004 | 0.674 | 0.203 | 0.061 | 0.37 | 0.111 |
| 0.552000000000004 | 0.671 | 0.204 | 0.062 | 0.37 | 0.113 |
| 0.556000000000004 | 0.668 | 0.206 | 0.064 | 0.371 | 0.115 |
| 0.560000000000004 | 0.664 | 0.208 | 0.065 | 0.372 | 0.117 |
| 0.564000000000004 | 0.661 | 0.21 | 0.067 | 0.373 | 0.119 |
| 0.568000000000004 | 0.657 | 0.212 | 0.068 | 0.373 | 0.12 |
| 0.572000000000004 | 0.654 | 0.214 | 0.07 | 0.374 | 0.122 |
| 0.576000000000004 | 0.651 | 0.216 | 0.072 | 0.375 | 0.124 |
| 0.580000000000004 | 0.647 | 0.218 | 0.073 | 0.375 | 0.126 |
| 0.584000000000004 | 0.644 | 0.22 | 0.075 | 0.376 | 0.128 |
| 0.588000000000004 | 0.641 | 0.221 | 0.077 | 0.377 | 0.13 |
| 0.592000000000004 | 0.637 | 0.223 | 0.078 | 0.377 | 0.132 |
| 0.596000000000004 | 0.634 | 0.225 | 0.08 | 0.378 | 0.134 |
| 0.600000000000004 | 0.631 | 0.227 | 0.082 | 0.378 | 0.136 |
| 0.604000000000004 | 0.627 | 0.229 | 0.083 | 0.379 | 0.138 |
| 0.608000000000004 | 0.624 | 0.231 | 0.085 | 0.379 | 0.14 |
| 0.612000000000004 | 0.621 | 0.232 | 0.087 | 0.38 | 0.142 |
| 0.616000000000004 | 0.617 | 0.234 | 0.089 | 0.38 | 0.144 |
| 0.620000000000004 | 0.614 | 0.236 | 0.091 | 0.381 | 0.146 |
| 0.624000000000004 | 0.611 | 0.238 | 0.093 | 0.381 | 0.148 |
| 0.628000000000004 | 0.607 | 0.24 | 0.094 | 0.381 | 0.15 |
| 0.632000000000004 | 0.604 | 0.241 | 0.096 | 0.382 | 0.152 |
| 0.636000000000004 | 0.601 | 0.243 | 0.098 | 0.382 | 0.155 |
| 0.640000000000004 | 0.598 | 0.245 | 0.1 | 0.382 | 0.157 |
| 0.644000000000004 | 0.594 | 0.246 | 0.102 | 0.383 | 0.159 |
| 0.648000000000004 | 0.591 | 0.248 | 0.104 | 0.383 | 0.161 |
| 0.652000000000004 | 0.588 | 0.25 | 0.106 | 0.383 | 0.163 |
| 0.656000000000004 | 0.585 | 0.252 | 0.108 | 0.383 | 0.165 |
| 0.660000000000004 | 0.581 | 0.253 | 0.11 | 0.384 | 0.167 |
| 0.664000000000004 | 0.578 | 0.255 | 0.112 | 0.384 | 0.169 |
| 0.668000000000004 | 0.575 | 0.257 | 0.114 | 0.384 | 0.171 |
| 0.672000000000004 | 0.572 | 0.258 | 0.117 | 0.384 | 0.174 |
| 0.676000000000004 | 0.569 | 0.26 | 0.119 | 0.384 | 0.176 |
| 0.680000000000004 | 0.565 | 0.261 | 0.121 | 0.385 | 0.178 |
| 0.684000000000004 | 0.562 | 0.263 | 0.123 | 0.385 | 0.18 |
| 0.688000000000004 | 0.559 | 0.265 | 0.125 | 0.385 | 0.182 |
| 0.692000000000004 | 0.556 | 0.266 | 0.128 | 0.385 | 0.184 |
| 0.696000000000004 | 0.553 | 0.268 | 0.13 | 0.385 | 0.186 |
| 0.700000000000004 | 0.55 | 0.269 | 0.132 | 0.385 | 0.189 |
| 0.704000000000004 | 0.547 | 0.271 | 0.134 | 0.385 | 0.191 |
| 0.708000000000004 | 0.544 | 0.273 | 0.137 | 0.385 | 0.193 |
| 0.712000000000004 | 0.541 | 0.274 | 0.139 | 0.385 | 0.195 |
| 0.716000000000004 | 0.538 | 0.276 | 0.141 | 0.385 | 0.197 |
| 0.720000000000004 | 0.534 | 0.277 | 0.144 | 0.385 | 0.199 |
| 0.724000000000004 | 0.531 | 0.279 | 0.146 | 0.385 | 0.202 |
| 0.728000000000004 | 0.528 | 0.28 | 0.148 | 0.385 | 0.204 |
| 0.732000000000004 | 0.525 | 0.282 | 0.151 | 0.385 | 0.206 |
| 0.736000000000004 | 0.522 | 0.283 | 0.153 | 0.384 | 0.208 |
| 0.740000000000004 | 0.519 | 0.284 | 0.156 | 0.384 | 0.21 |
| 0.744000000000004 | 0.516 | 0.286 | 0.158 | 0.384 | 0.213 |
| 0.748000000000004 | 0.513 | 0.287 | 0.161 | 0.384 | 0.215 |
| 0.752000000000004 | 0.511 | 0.289 | 0.163 | 0.384 | 0.217 |
| 0.756000000000004 | 0.508 | 0.29 | 0.166 | 0.384 | 0.219 |
| 0.760000000000004 | 0.505 | 0.291 | 0.168 | 0.384 | 0.222 |
| 0.764000000000004 | 0.502 | 0.293 | 0.171 | 0.383 | 0.224 |
| 0.768000000000004 | 0.499 | 0.294 | 0.174 | 0.383 | 0.226 |
| 0.772000000000004 | 0.496 | 0.296 | 0.176 | 0.383 | 0.228 |
| 0.776000000000004 | 0.493 | 0.297 | 0.179 | 0.383 | 0.23 |
| 0.780000000000004 | 0.49 | 0.298 | 0.181 | 0.382 | 0.233 |
| 0.784000000000004 | 0.487 | 0.3 | 0.184 | 0.382 | 0.235 |
| 0.788000000000004 | 0.485 | 0.301 | 0.187 | 0.382 | 0.237 |
| 0.792000000000004 | 0.482 | 0.302 | 0.19 | 0.382 | 0.239 |
| 0.796000000000004 | 0.479 | 0.303 | 0.192 | 0.381 | 0.242 |
| 0.800000000000004 | 0.476 | 0.305 | 0.195 | 0.381 | 0.244 |
| 0.804000000000004 | 0.473 | 0.306 | 0.198 | 0.381 | 0.246 |
| 0.808000000000004 | 0.471 | 0.307 | 0.201 | 0.38 | 0.248 |
| 0.812000000000004 | 0.468 | 0.308 | 0.203 | 0.38 | 0.25 |
| 0.816000000000004 | 0.465 | 0.31 | 0.206 | 0.38 | 0.253 |
| 0.820000000000004 | 0.462 | 0.311 | 0.209 | 0.379 | 0.255 |
| 0.824000000000004 | 0.46 | 0.312 | 0.212 | 0.379 | 0.257 |
| 0.828000000000004 | 0.457 | 0.313 | 0.215 | 0.378 | 0.259 |
| 0.832000000000004 | 0.454 | 0.314 | 0.218 | 0.378 | 0.262 |
| 0.836000000000004 | 0.452 | 0.316 | 0.221 | 0.378 | 0.264 |
| 0.840000000000004 | 0.449 | 0.317 | 0.224 | 0.377 | 0.266 |
| 0.844000000000004 | 0.446 | 0.318 | 0.226 | 0.377 | 0.268 |
| 0.848000000000004 | 0.444 | 0.319 | 0.229 | 0.376 | 0.271 |
| 0.852000000000004 | 0.441 | 0.32 | 0.232 | 0.376 | 0.273 |
| 0.856000000000004 | 0.438 | 0.321 | 0.235 | 0.375 | 0.275 |
| 0.860000000000004 | 0.436 | 0.322 | 0.238 | 0.375 | 0.277 |
| 0.864000000000004 | 0.433 | 0.323 | 0.241 | 0.374 | 0.279 |
| 0.868000000000004 | 0.431 | 0.324 | 0.244 | 0.374 | 0.282 |
| 0.872000000000004 | 0.428 | 0.326 | 0.248 | 0.373 | 0.284 |
| 0.876000000000004 | 0.426 | 0.327 | 0.251 | 0.373 | 0.286 |
| 0.880000000000004 | 0.423 | 0.328 | 0.254 | 0.372 | 0.288 |
| 0.884000000000004 | 0.421 | 0.329 | 0.257 | 0.372 | 0.291 |
| 0.888000000000004 | 0.418 | 0.33 | 0.26 | 0.371 | 0.293 |
| 0.892000000000004 | 0.416 | 0.331 | 0.263 | 0.371 | 0.295 |
| 0.896000000000004 | 0.413 | 0.332 | 0.266 | 0.37 | 0.297 |
| 0.900000000000004 | 0.411 | 0.333 | 0.269 | 0.37 | 0.299 |
| 0.904000000000004 | 0.408 | 0.334 | 0.273 | 0.369 | 0.302 |
| 0.908000000000004 | 0.406 | 0.335 | 0.276 | 0.368 | 0.304 |
| 0.912000000000004 | 0.403 | 0.335 | 0.279 | 0.368 | 0.306 |
| 0.916000000000004 | 0.401 | 0.336 | 0.282 | 0.367 | 0.308 |
| 0.920000000000004 | 0.399 | 0.337 | 0.286 | 0.367 | 0.31 |
| 0.924000000000004 | 0.396 | 0.338 | 0.289 | 0.366 | 0.313 |
| 0.928000000000004 | 0.394 | 0.339 | 0.292 | 0.365 | 0.315 |
| 0.932000000000004 | 0.391 | 0.34 | 0.295 | 0.365 | 0.317 |
| 0.936000000000004 | 0.389 | 0.341 | 0.299 | 0.364 | 0.319 |
| 0.940000000000004 | 0.387 | 0.342 | 0.302 | 0.364 | 0.321 |
| 0.944000000000004 | 0.385 | 0.343 | 0.305 | 0.363 | 0.323 |
| 0.948000000000004 | 0.382 | 0.344 | 0.309 | 0.362 | 0.326 |
| 0.952000000000004 | 0.38 | 0.344 | 0.312 | 0.362 | 0.328 |
| 0.956000000000004 | 0.378 | 0.345 | 0.315 | 0.361 | 0.33 |
| 0.960000000000004 | 0.375 | 0.346 | 0.319 | 0.36 | 0.332 |
| 0.964000000000004 | 0.373 | 0.347 | 0.322 | 0.36 | 0.334 |
| 0.968000000000004 | 0.371 | 0.348 | 0.326 | 0.359 | 0.336 |
| 0.972000000000004 | 0.369 | 0.348 | 0.329 | 0.358 | 0.339 |
| 0.976000000000004 | 0.367 | 0.349 | 0.333 | 0.358 | 0.341 |
| 0.980000000000004 | 0.364 | 0.35 | 0.336 | 0.357 | 0.343 |
| 0.984000000000004 | 0.362 | 0.351 | 0.34 | 0.356 | 0.345 |
| 0.988000000000004 | 0.36 | 0.351 | 0.343 | 0.356 | 0.347 |
| 0.992000000000004 | 0.358 | 0.352 | 0.347 | 0.355 | 0.349 |
| 0.996000000000004 | 0.356 | 0.353 | 0.35 | 0.354 | 0.351 |
| 1.000000000000004 | 0.354 | 0.354 | 0.354 | 0.354 | 0.354 |
| 1.004000000000004 | 0.351 | 0.354 | 0.357 | 0.353 | 0.356 |
| 1.008000000000004 | 0.349 | 0.355 | 0.361 | 0.352 | 0.358 |
| 1.012000000000004 | 0.347 | 0.356 | 0.364 | 0.351 | 0.36 |
| 1.016000000000004 | 0.345 | 0.356 | 0.368 | 0.351 | 0.362 |
| 1.020000000000004 | 0.343 | 0.357 | 0.371 | 0.35 | 0.364 |
| 1.024000000000004 | 0.341 | 0.358 | 0.375 | 0.349 | 0.366 |
| 1.028000000000004 | 0.339 | 0.358 | 0.379 | 0.349 | 0.368 |
| 1.032000000000004 | 0.337 | 0.359 | 0.382 | 0.348 | 0.37 |
| 1.036000000000004 | 0.335 | 0.36 | 0.386 | 0.347 | 0.372 |
| 1.040000000000004 | 0.333 | 0.36 | 0.39 | 0.346 | 0.375 |
| 1.044000000000004 | 0.331 | 0.361 | 0.393 | 0.346 | 0.377 |
| 1.048000000000004 | 0.329 | 0.361 | 0.397 | 0.345 | 0.379 |
| 1.052000000000004 | 0.327 | 0.362 | 0.401 | 0.344 | 0.381 |
| 1.056000000000004 | 0.325 | 0.363 | 0.404 | 0.343 | 0.383 |
| 1.060000000000004 | 0.323 | 0.363 | 0.408 | 0.343 | 0.385 |
| 1.064000000000004 | 0.321 | 0.364 | 0.412 | 0.342 | 0.387 |
| 1.068000000000004 | 0.319 | 0.364 | 0.415 | 0.341 | 0.389 |
| 1.072000000000004 | 0.317 | 0.365 | 0.419 | 0.34 | 0.391 |
| 1.076000000000004 | 0.315 | 0.365 | 0.423 | 0.339 | 0.393 |
| 1.080000000000004 | 0.314 | 0.366 | 0.427 | 0.339 | 0.395 |
| 1.084000000000004 | 0.312 | 0.366 | 0.43 | 0.338 | 0.397 |
| 1.088000000000004 | 0.31 | 0.367 | 0.434 | 0.337 | 0.399 |
| 1.092000000000004 | 0.308 | 0.367 | 0.438 | 0.336 | 0.401 |
| 1.096000000000004 | 0.306 | 0.368 | 0.442 | 0.336 | 0.403 |
| 1.100000000000004 | 0.304 | 0.368 | 0.446 | 0.335 | 0.405 |
| 1.104000000000004 | 0.303 | 0.369 | 0.449 | 0.334 | 0.407 |
| 1.108000000000004 | 0.301 | 0.369 | 0.453 | 0.333 | 0.409 |
| 1.112000000000004 | 0.299 | 0.37 | 0.457 | 0.332 | 0.411 |
| 1.116000000000004 | 0.297 | 0.37 | 0.461 | 0.332 | 0.413 |
| 1.120000000000004 | 0.295 | 0.371 | 0.465 | 0.331 | 0.415 |
| 1.124000000000004 | 0.294 | 0.371 | 0.469 | 0.33 | 0.417 |
| 1.128000000000004 | 0.292 | 0.371 | 0.473 | 0.329 | 0.419 |
| 1.132000000000004 | 0.29 | 0.372 | 0.477 | 0.329 | 0.421 |
| 1.136000000000004 | 0.288 | 0.372 | 0.48 | 0.328 | 0.423 |
| 1.140000000000004 | 0.287 | 0.373 | 0.484 | 0.327 | 0.425 |
| 1.144000000000004 | 0.285 | 0.373 | 0.488 | 0.326 | 0.427 |
| 1.148000000000004 | 0.283 | 0.373 | 0.492 | 0.325 | 0.429 |
| 1.152000000000004 | 0.282 | 0.374 | 0.496 | 0.325 | 0.431 |
| 1.156000000000004 | 0.28 | 0.374 | 0.5 | 0.324 | 0.433 |
| 1.160000000000004 | 0.278 | 0.375 | 0.504 | 0.323 | 0.435 |
| 1.164000000000004 | 0.277 | 0.375 | 0.508 | 0.322 | 0.436 |
| 1.168000000000004 | 0.275 | 0.375 | 0.512 | 0.321 | 0.438 |
| 1.172000000000004 | 0.273 | 0.376 | 0.516 | 0.32 | 0.44 |
| 1.176000000000004 | 0.272 | 0.376 | 0.52 | 0.32 | 0.442 |
| 1.180000000000004 | 0.27 | 0.376 | 0.524 | 0.319 | 0.444 |
| 1.184000000000004 | 0.269 | 0.377 | 0.528 | 0.318 | 0.446 |
| 1.188000000000004 | 0.267 | 0.377 | 0.532 | 0.317 | 0.448 |
| 1.192000000000004 | 0.265 | 0.377 | 0.536 | 0.316 | 0.45 |
| 1.196000000000004 | 0.264 | 0.378 | 0.54 | 0.316 | 0.452 |
| 1.200000000000004 | 0.262 | 0.378 | 0.544 | 0.315 | 0.453 |
| 1.204000000000004 | 0.261 | 0.378 | 0.548 | 0.314 | 0.455 |
| 1.208000000000004 | 0.259 | 0.378 | 0.552 | 0.313 | 0.457 |
| 1.212000000000004 | 0.258 | 0.379 | 0.556 | 0.312 | 0.459 |
| 1.216000000000004 | 0.256 | 0.379 | 0.56 | 0.312 | 0.461 |
| 1.220000000000004 | 0.255 | 0.379 | 0.564 | 0.311 | 0.463 |
| 1.224000000000004 | 0.253 | 0.379 | 0.568 | 0.31 | 0.464 |
| 1.228000000000004 | 0.252 | 0.38 | 0.573 | 0.309 | 0.466 |
| 1.232000000000004 | 0.25 | 0.38 | 0.577 | 0.308 | 0.468 |
| 1.236000000000004 | 0.249 | 0.38 | 0.581 | 0.308 | 0.47 |
| 1.240000000000004 | 0.247 | 0.38 | 0.585 | 0.307 | 0.472 |
| 1.244000000000004 | 0.246 | 0.381 | 0.589 | 0.306 | 0.473 |
| 1.248000000000004 | 0.244 | 0.381 | 0.593 | 0.305 | 0.475 |
| 1.252000000000004 | 0.243 | 0.381 | 0.597 | 0.304 | 0.477 |
| 1.256000000000004 | 0.242 | 0.381 | 0.601 | 0.304 | 0.479 |
| 1.260000000000004 | 0.24 | 0.381 | 0.606 | 0.303 | 0.481 |
| 1.264000000000004 | 0.239 | 0.382 | 0.61 | 0.302 | 0.482 |
| 1.268000000000004 | 0.237 | 0.382 | 0.614 | 0.301 | 0.484 |
| 1.272000000000004 | 0.236 | 0.382 | 0.618 | 0.3 | 0.486 |
| 1.276000000000004 | 0.235 | 0.382 | 0.622 | 0.299 | 0.488 |
| 1.280000000000004 | 0.233 | 0.382 | 0.626 | 0.299 | 0.489 |
| 1.284000000000004 | 0.232 | 0.382 | 0.631 | 0.298 | 0.491 |
| 1.288000000000004 | 0.231 | 0.383 | 0.635 | 0.297 | 0.493 |
| 1.292000000000004 | 0.229 | 0.383 | 0.639 | 0.296 | 0.495 |
| 1.296000000000004 | 0.228 | 0.383 | 0.643 | 0.295 | 0.496 |
| 1.300000000000004 | 0.227 | 0.383 | 0.647 | 0.295 | 0.498 |
| 1.304000000000004 | 0.225 | 0.383 | 0.652 | 0.294 | 0.5 |
| 1.308000000000004 | 0.224 | 0.383 | 0.656 | 0.293 | 0.501 |
| 1.312000000000004 | 0.223 | 0.383 | 0.66 | 0.292 | 0.503 |
| 1.316000000000004 | 0.221 | 0.384 | 0.664 | 0.291 | 0.505 |
| 1.320000000000004 | 0.22 | 0.384 | 0.668 | 0.291 | 0.506 |
| 1.324000000000004 | 0.219 | 0.384 | 0.673 | 0.29 | 0.508 |
| 1.328000000000004 | 0.218 | 0.384 | 0.677 | 0.289 | 0.51 |
| 1.332000000000004 | 0.216 | 0.384 | 0.681 | 0.288 | 0.511 |
| 1.336000000000004 | 0.215 | 0.384 | 0.686 | 0.287 | 0.513 |
| 1.340000000000004 | 0.214 | 0.384 | 0.69 | 0.287 | 0.515 |
| 1.344000000000004 | 0.213 | 0.384 | 0.694 | 0.286 | 0.516 |
| 1.348000000000004 | 0.211 | 0.384 | 0.698 | 0.285 | 0.518 |
| 1.352000000000004 | 0.21 | 0.384 | 0.703 | 0.284 | 0.52 |
| 1.356000000000004 | 0.209 | 0.384 | 0.707 | 0.284 | 0.521 |
| 1.360000000000004 | 0.208 | 0.385 | 0.711 | 0.283 | 0.523 |
| 1.364000000000004 | 0.207 | 0.385 | 0.715 | 0.282 | 0.525 |
| 1.368000000000004 | 0.206 | 0.385 | 0.72 | 0.281 | 0.526 |
| 1.372000000000004 | 0.204 | 0.385 | 0.724 | 0.28 | 0.528 |
| 1.376000000000004 | 0.203 | 0.385 | 0.728 | 0.28 | 0.529 |
| 1.380000000000004 | 0.202 | 0.385 | 0.733 | 0.279 | 0.531 |
| 1.384000000000004 | 0.201 | 0.385 | 0.737 | 0.278 | 0.533 |
| 1.388000000000005 | 0.2 | 0.385 | 0.741 | 0.277 | 0.534 |
| 1.392000000000004 | 0.199 | 0.385 | 0.746 | 0.276 | 0.536 |
| 1.396000000000004 | 0.197 | 0.385 | 0.75 | 0.276 | 0.537 |
| 1.400000000000005 | 0.196 | 0.385 | 0.754 | 0.275 | 0.539 |
| 1.404000000000005 | 0.195 | 0.385 | 0.759 | 0.274 | 0.54 |
| 1.408000000000005 | 0.194 | 0.385 | 0.763 | 0.273 | 0.542 |
| 1.412000000000005 | 0.193 | 0.385 | 0.767 | 0.273 | 0.543 |
| 1.416000000000005 | 0.192 | 0.385 | 0.772 | 0.272 | 0.545 |
| 1.420000000000005 | 0.191 | 0.385 | 0.776 | 0.271 | 0.547 |
| 1.424000000000005 | 0.19 | 0.385 | 0.78 | 0.27 | 0.548 |
| 1.428000000000005 | 0.189 | 0.385 | 0.785 | 0.27 | 0.55 |
| 1.432000000000005 | 0.188 | 0.385 | 0.789 | 0.269 | 0.551 |
| 1.436000000000005 | 0.187 | 0.385 | 0.794 | 0.268 | 0.553 |
| 1.440000000000005 | 0.186 | 0.385 | 0.798 | 0.267 | 0.554 |
| 1.444000000000005 | 0.185 | 0.385 | 0.802 | 0.266 | 0.556 |
| 1.448000000000005 | 0.184 | 0.385 | 0.807 | 0.266 | 0.557 |
| 1.452000000000005 | 0.182 | 0.385 | 0.811 | 0.265 | 0.559 |
| 1.456000000000005 | 0.181 | 0.385 | 0.816 | 0.264 | 0.56 |
| 1.460000000000005 | 0.18 | 0.385 | 0.82 | 0.263 | 0.562 |
| 1.464000000000005 | 0.179 | 0.385 | 0.824 | 0.263 | 0.563 |
| 1.468000000000005 | 0.178 | 0.385 | 0.829 | 0.262 | 0.565 |
| 1.472000000000005 | 0.177 | 0.384 | 0.833 | 0.261 | 0.566 |
| 1.476000000000005 | 0.176 | 0.384 | 0.838 | 0.26 | 0.567 |
| 1.480000000000005 | 0.175 | 0.384 | 0.842 | 0.26 | 0.569 |
| 1.484000000000005 | 0.175 | 0.384 | 0.846 | 0.259 | 0.57 |
| 1.488000000000005 | 0.174 | 0.384 | 0.851 | 0.258 | 0.572 |
| 1.492000000000005 | 0.173 | 0.384 | 0.855 | 0.257 | 0.573 |
| 1.496000000000005 | 0.172 | 0.384 | 0.86 | 0.257 | 0.575 |
| 1.500000000000005 | 0.171 | 0.384 | 0.864 | 0.256 | 0.576 |
| 1.504000000000005 | 0.17 | 0.384 | 0.868 | 0.255 | 0.577 |
| 1.508000000000005 | 0.169 | 0.384 | 0.873 | 0.255 | 0.579 |
| 1.512000000000005 | 0.168 | 0.384 | 0.877 | 0.254 | 0.58 |
| 1.516000000000005 | 0.167 | 0.384 | 0.882 | 0.253 | 0.582 |
| 1.520000000000005 | 0.166 | 0.384 | 0.886 | 0.252 | 0.583 |
| 1.524000000000005 | 0.165 | 0.383 | 0.891 | 0.252 | 0.584 |
| 1.528000000000005 | 0.164 | 0.383 | 0.895 | 0.251 | 0.586 |
| 1.532000000000005 | 0.163 | 0.383 | 0.9 | 0.25 | 0.587 |
| 1.536000000000005 | 0.162 | 0.383 | 0.904 | 0.249 | 0.589 |
| 1.540000000000005 | 0.162 | 0.383 | 0.909 | 0.249 | 0.59 |
| 1.544000000000005 | 0.161 | 0.383 | 0.913 | 0.248 | 0.591 |
| 1.548000000000005 | 0.16 | 0.383 | 0.917 | 0.247 | 0.593 |
| 1.552000000000005 | 0.159 | 0.383 | 0.922 | 0.247 | 0.594 |
| 1.556000000000005 | 0.158 | 0.383 | 0.926 | 0.246 | 0.595 |
| 1.560000000000005 | 0.157 | 0.382 | 0.931 | 0.245 | 0.597 |
| 1.564000000000005 | 0.156 | 0.382 | 0.935 | 0.244 | 0.598 |
| 1.568000000000005 | 0.155 | 0.382 | 0.94 | 0.244 | 0.599 |
| 1.572000000000005 | 0.155 | 0.382 | 0.944 | 0.243 | 0.601 |
| 1.576000000000005 | 0.154 | 0.382 | 0.949 | 0.242 | 0.602 |
| 1.580000000000005 | 0.153 | 0.382 | 0.953 | 0.242 | 0.603 |
| 1.584000000000005 | 0.152 | 0.382 | 0.958 | 0.241 | 0.605 |
| 1.588000000000005 | 0.151 | 0.382 | 0.962 | 0.24 | 0.606 |
| 1.592000000000005 | 0.15 | 0.381 | 0.967 | 0.24 | 0.607 |
| 1.596000000000005 | 0.15 | 0.381 | 0.971 | 0.239 | 0.609 |
| 1.600000000000005 | 0.149 | 0.381 | 0.976 | 0.238 | 0.61 |
| 1.604000000000005 | 0.148 | 0.381 | 0.98 | 0.238 | 0.611 |
| 1.608000000000005 | 0.147 | 0.381 | 0.985 | 0.237 | 0.612 |
| 1.612000000000005 | 0.146 | 0.381 | 0.989 | 0.236 | 0.614 |
| 1.616000000000005 | 0.146 | 0.381 | 0.994 | 0.235 | 0.615 |
| 1.620000000000005 | 0.145 | 0.38 | 0.998 | 0.235 | 0.616 |
| 1.624000000000005 | 0.144 | 0.38 | 1.003 | 0.234 | 0.617 |
| 1.628000000000005 | 0.143 | 0.38 | 1.007 | 0.233 | 0.619 |
| 1.632000000000005 | 0.143 | 0.38 | 1.012 | 0.233 | 0.62 |
| 1.636000000000005 | 0.142 | 0.38 | 1.016 | 0.232 | 0.621 |
| 1.640000000000005 | 0.141 | 0.38 | 1.021 | 0.231 | 0.622 |
| 1.644000000000005 | 0.14 | 0.379 | 1.025 | 0.231 | 0.624 |
| 1.648000000000005 | 0.14 | 0.379 | 1.03 | 0.23 | 0.625 |
| 1.652000000000005 | 0.139 | 0.379 | 1.034 | 0.229 | 0.626 |
| 1.656000000000005 | 0.138 | 0.379 | 1.039 | 0.229 | 0.627 |
| 1.660000000000005 | 0.137 | 0.379 | 1.043 | 0.228 | 0.628 |
| 1.664000000000005 | 0.137 | 0.378 | 1.048 | 0.227 | 0.63 |
| 1.668000000000005 | 0.136 | 0.378 | 1.052 | 0.227 | 0.631 |
| 1.672000000000005 | 0.135 | 0.378 | 1.057 | 0.226 | 0.632 |
| 1.676000000000005 | 0.135 | 0.378 | 1.061 | 0.225 | 0.633 |
| 1.680000000000005 | 0.134 | 0.378 | 1.066 | 0.225 | 0.634 |
| 1.684000000000005 | 0.133 | 0.377 | 1.07 | 0.224 | 0.636 |
| 1.688000000000005 | 0.132 | 0.377 | 1.075 | 0.224 | 0.637 |
| 1.692000000000005 | 0.132 | 0.377 | 1.08 | 0.223 | 0.638 |
| 1.696000000000005 | 0.131 | 0.377 | 1.084 | 0.222 | 0.639 |
| 1.700000000000005 | 0.13 | 0.377 | 1.089 | 0.222 | 0.64 |
| 1.704000000000005 | 0.13 | 0.376 | 1.093 | 0.221 | 0.642 |
| 1.708000000000005 | 0.129 | 0.376 | 1.098 | 0.22 | 0.643 |
| 1.712000000000005 | 0.128 | 0.376 | 1.102 | 0.22 | 0.644 |
| 1.716000000000005 | 0.128 | 0.376 | 1.107 | 0.219 | 0.645 |
| 1.720000000000005 | 0.127 | 0.376 | 1.111 | 0.218 | 0.646 |
| 1.724000000000005 | 0.126 | 0.375 | 1.116 | 0.218 | 0.647 |
| 1.728000000000005 | 0.126 | 0.375 | 1.12 | 0.217 | 0.648 |
| 1.732000000000005 | 0.125 | 0.375 | 1.125 | 0.217 | 0.65 |
| 1.736000000000005 | 0.124 | 0.375 | 1.129 | 0.216 | 0.651 |
| 1.740000000000005 | 0.124 | 0.375 | 1.134 | 0.215 | 0.652 |
| 1.744000000000005 | 0.123 | 0.374 | 1.139 | 0.215 | 0.653 |
| 1.748000000000005 | 0.122 | 0.374 | 1.143 | 0.214 | 0.654 |
| 1.752000000000005 | 0.122 | 0.374 | 1.148 | 0.213 | 0.655 |
| 1.756000000000005 | 0.121 | 0.374 | 1.152 | 0.213 | 0.656 |
| 1.760000000000005 | 0.121 | 0.373 | 1.157 | 0.212 | 0.657 |
| 1.764000000000005 | 0.12 | 0.373 | 1.161 | 0.212 | 0.658 |
| 1.768000000000005 | 0.119 | 0.373 | 1.166 | 0.211 | 0.659 |
| 1.772000000000005 | 0.119 | 0.373 | 1.17 | 0.21 | 0.661 |
| 1.776000000000005 | 0.118 | 0.373 | 1.175 | 0.21 | 0.662 |
| 1.780000000000005 | 0.118 | 0.372 | 1.18 | 0.209 | 0.663 |
| 1.784000000000005 | 0.117 | 0.372 | 1.184 | 0.209 | 0.664 |
| 1.788000000000005 | 0.116 | 0.372 | 1.189 | 0.208 | 0.665 |
| 1.792000000000005 | 0.116 | 0.372 | 1.193 | 0.207 | 0.666 |
| 1.796000000000005 | 0.115 | 0.371 | 1.198 | 0.207 | 0.667 |
| 1.800000000000005 | 0.115 | 0.371 | 1.202 | 0.206 | 0.668 |
| 1.804000000000005 | 0.114 | 0.371 | 1.207 | 0.206 | 0.669 |
| 1.808000000000005 | 0.113 | 0.371 | 1.212 | 0.205 | 0.67 |
| 1.812000000000005 | 0.113 | 0.37 | 1.216 | 0.204 | 0.671 |
| 1.816000000000005 | 0.112 | 0.37 | 1.221 | 0.204 | 0.672 |
| 1.820000000000005 | 0.112 | 0.37 | 1.225 | 0.203 | 0.673 |
| 1.824000000000005 | 0.111 | 0.37 | 1.23 | 0.203 | 0.674 |
| 1.828000000000005 | 0.111 | 0.369 | 1.234 | 0.202 | 0.675 |
| 1.832000000000005 | 0.11 | 0.369 | 1.239 | 0.201 | 0.676 |
| 1.836000000000005 | 0.109 | 0.369 | 1.243 | 0.201 | 0.677 |
| 1.840000000000005 | 0.109 | 0.369 | 1.248 | 0.2 | 0.678 |
| 1.844000000000005 | 0.108 | 0.368 | 1.253 | 0.2 | 0.679 |
| 1.848000000000005 | 0.108 | 0.368 | 1.257 | 0.199 | 0.68 |
| 1.852000000000005 | 0.107 | 0.368 | 1.262 | 0.199 | 0.681 |
| 1.856000000000005 | 0.107 | 0.368 | 1.266 | 0.198 | 0.682 |
| 1.860000000000005 | 0.106 | 0.367 | 1.271 | 0.198 | 0.683 |
| 1.864000000000005 | 0.106 | 0.367 | 1.275 | 0.197 | 0.684 |
| 1.868000000000005 | 0.105 | 0.367 | 1.28 | 0.196 | 0.685 |
| 1.872000000000005 | 0.105 | 0.367 | 1.285 | 0.196 | 0.686 |
| 1.876000000000005 | 0.104 | 0.366 | 1.289 | 0.195 | 0.687 |
| 1.880000000000005 | 0.104 | 0.366 | 1.294 | 0.195 | 0.688 |
| 1.884000000000005 | 0.103 | 0.366 | 1.298 | 0.194 | 0.689 |
| 1.888000000000005 | 0.103 | 0.366 | 1.303 | 0.194 | 0.69 |
| 1.892000000000005 | 0.102 | 0.365 | 1.307 | 0.193 | 0.691 |
| 1.896000000000005 | 0.102 | 0.365 | 1.312 | 0.193 | 0.692 |
| 1.900000000000005 | 0.101 | 0.365 | 1.317 | 0.192 | 0.693 |
| 1.904000000000005 | 0.101 | 0.364 | 1.321 | 0.191 | 0.694 |
| 1.908000000000005 | 0.1 | 0.364 | 1.326 | 0.191 | 0.695 |
| 1.912000000000005 | 0.1 | 0.364 | 1.33 | 0.19 | 0.696 |
| 1.916000000000005 | 0.099 | 0.364 | 1.335 | 0.19 | 0.697 |
| 1.920000000000005 | 0.099 | 0.363 | 1.34 | 0.189 | 0.698 |
| 1.924000000000005 | 0.098 | 0.363 | 1.344 | 0.189 | 0.699 |
| 1.928000000000005 | 0.098 | 0.363 | 1.349 | 0.188 | 0.7 |
| 1.932000000000005 | 0.097 | 0.363 | 1.353 | 0.188 | 0.7 |
| 1.936000000000005 | 0.097 | 0.362 | 1.358 | 0.187 | 0.701 |
| 1.940000000000005 | 0.096 | 0.362 | 1.362 | 0.187 | 0.702 |
| 1.944000000000005 | 0.096 | 0.362 | 1.367 | 0.186 | 0.703 |
| 1.948000000000005 | 0.095 | 0.361 | 1.372 | 0.186 | 0.704 |
| 1.952000000000005 | 0.095 | 0.361 | 1.376 | 0.185 | 0.705 |
| 1.956000000000005 | 0.094 | 0.361 | 1.381 | 0.185 | 0.706 |
| 1.960000000000005 | 0.094 | 0.361 | 1.385 | 0.184 | 0.707 |
| 1.964000000000005 | 0.093 | 0.36 | 1.39 | 0.183 | 0.708 |
| 1.968000000000005 | 0.093 | 0.36 | 1.394 | 0.183 | 0.709 |
| 1.972000000000005 | 0.093 | 0.36 | 1.399 | 0.182 | 0.709 |
| 1.976000000000005 | 0.092 | 0.359 | 1.404 | 0.182 | 0.71 |
| 1.980000000000005 | 0.092 | 0.359 | 1.408 | 0.181 | 0.711 |
| 1.984000000000005 | 0.091 | 0.359 | 1.413 | 0.181 | 0.712 |
| 1.988000000000005 | 0.091 | 0.359 | 1.417 | 0.18 | 0.713 |
| 1.992000000000005 | 0.09 | 0.358 | 1.422 | 0.18 | 0.714 |
| 1.996000000000005 | 0.09 | 0.358 | 1.427 | 0.179 | 0.715 |
| 2.000000000000005 | 0.089 | 0.358 | 1.431 | 0.179 | 0.716 |
| 2.004000000000005 | 0.089 | 0.357 | 1.436 | 0.178 | 0.716 |
| 2.008000000000005 | 0.089 | 0.357 | 1.44 | 0.178 | 0.717 |
| 2.012000000000005 | 0.088 | 0.357 | 1.445 | 0.177 | 0.718 |
| 2.016000000000005 | 0.088 | 0.357 | 1.449 | 0.177 | 0.719 |
| 2.020000000000005 | 0.087 | 0.356 | 1.454 | 0.176 | 0.72 |
| 2.024000000000005 | 0.087 | 0.356 | 1.459 | 0.176 | 0.721 |
| 2.028000000000005 | 0.086 | 0.356 | 1.463 | 0.175 | 0.721 |
| 2.032000000000005 | 0.086 | 0.355 | 1.468 | 0.175 | 0.722 |
| 2.036000000000005 | 0.086 | 0.355 | 1.472 | 0.174 | 0.723 |
| 2.040000000000005 | 0.085 | 0.355 | 1.477 | 0.174 | 0.724 |
| 2.044000000000005 | 0.085 | 0.355 | 1.481 | 0.173 | 0.725 |
| 2.048000000000005 | 0.084 | 0.354 | 1.486 | 0.173 | 0.726 |
| 2.052000000000005 | 0.084 | 0.354 | 1.491 | 0.173 | 0.726 |
| 2.056000000000005 | 0.084 | 0.354 | 1.495 | 0.172 | 0.727 |
| 2.060000000000005 | 0.083 | 0.353 | 1.5 | 0.172 | 0.728 |
| 2.064000000000005 | 0.083 | 0.353 | 1.504 | 0.171 | 0.729 |
| 2.068000000000005 | 0.083 | 0.353 | 1.509 | 0.171 | 0.73 |
| 2.072000000000005 | 0.082 | 0.353 | 1.514 | 0.17 | 0.73 |
| 2.076000000000005 | 0.082 | 0.352 | 1.518 | 0.17 | 0.731 |
| 2.080000000000005 | 0.081 | 0.352 | 1.523 | 0.169 | 0.732 |
| 2.084000000000005 | 0.081 | 0.352 | 1.527 | 0.169 | 0.733 |
| 2.088000000000005 | 0.081 | 0.351 | 1.532 | 0.168 | 0.734 |
| 2.092000000000005 | 0.08 | 0.351 | 1.536 | 0.168 | 0.734 |
| 2.096000000000005 | 0.08 | 0.351 | 1.541 | 0.167 | 0.735 |
| 2.100000000000005 | 0.079 | 0.35 | 1.546 | 0.167 | 0.736 |
| 2.104000000000005 | 0.079 | 0.35 | 1.55 | 0.166 | 0.737 |
| 2.108000000000005 | 0.079 | 0.35 | 1.555 | 0.166 | 0.738 |
| 2.112000000000005 | 0.078 | 0.35 | 1.559 | 0.166 | 0.738 |
| 2.116000000000005 | 0.078 | 0.349 | 1.564 | 0.165 | 0.739 |
| 2.120000000000005 | 0.078 | 0.349 | 1.568 | 0.165 | 0.74 |
| 2.124000000000005 | 0.077 | 0.349 | 1.573 | 0.164 | 0.741 |
| 2.128000000000005 | 0.077 | 0.348 | 1.578 | 0.164 | 0.741 |
| 2.132000000000005 | 0.077 | 0.348 | 1.582 | 0.163 | 0.742 |
| 2.136000000000005 | 0.076 | 0.348 | 1.587 | 0.163 | 0.743 |
| 2.140000000000005 | 0.076 | 0.347 | 1.591 | 0.162 | 0.744 |
| 2.144000000000005 | 0.076 | 0.347 | 1.596 | 0.162 | 0.744 |
| 2.148000000000005 | 0.075 | 0.347 | 1.6 | 0.161 | 0.745 |
| 2.152000000000005 | 0.075 | 0.347 | 1.605 | 0.161 | 0.746 |
| 2.156000000000005 | 0.074 | 0.346 | 1.61 | 0.161 | 0.747 |
| 2.160000000000005 | 0.074 | 0.346 | 1.614 | 0.16 | 0.747 |
| 2.164000000000005 | 0.074 | 0.346 | 1.619 | 0.16 | 0.748 |
| 2.168000000000005 | 0.073 | 0.345 | 1.623 | 0.159 | 0.749 |
| 2.172000000000005 | 0.073 | 0.345 | 1.628 | 0.159 | 0.749 |
| 2.176000000000005 | 0.073 | 0.345 | 1.632 | 0.158 | 0.75 |
| 2.180000000000005 | 0.072 | 0.344 | 1.637 | 0.158 | 0.751 |
| 2.184000000000005 | 0.072 | 0.344 | 1.642 | 0.158 | 0.752 |
| 2.188000000000005 | 0.072 | 0.344 | 1.646 | 0.157 | 0.752 |
| 2.192000000000005 | 0.072 | 0.344 | 1.651 | 0.157 | 0.753 |
| 2.196000000000005 | 0.071 | 0.343 | 1.655 | 0.156 | 0.754 |
| 2.200000000000005 | 0.071 | 0.343 | 1.66 | 0.156 | 0.754 |
| 2.204000000000005 | 0.071 | 0.343 | 1.664 | 0.155 | 0.755 |
| 2.208000000000005 | 0.07 | 0.342 | 1.669 | 0.155 | 0.756 |
| 2.212000000000005 | 0.07 | 0.342 | 1.674 | 0.155 | 0.757 |
| 2.216000000000005 | 0.07 | 0.342 | 1.678 | 0.154 | 0.757 |
| 2.220000000000005 | 0.069 | 0.341 | 1.683 | 0.154 | 0.758 |
| 2.224000000000005 | 0.069 | 0.341 | 1.687 | 0.153 | 0.759 |
| 2.228000000000005 | 0.069 | 0.341 | 1.692 | 0.153 | 0.759 |
| 2.232000000000005 | 0.068 | 0.341 | 1.696 | 0.153 | 0.76 |
| 2.236000000000005 | 0.068 | 0.34 | 1.701 | 0.152 | 0.761 |
| 2.240000000000005 | 0.068 | 0.34 | 1.706 | 0.152 | 0.761 |
| 2.244000000000005 | 0.067 | 0.34 | 1.71 | 0.151 | 0.762 |
| 2.248000000000005 | 0.067 | 0.339 | 1.715 | 0.151 | 0.763 |
| 2.252000000000005 | 0.067 | 0.339 | 1.719 | 0.151 | 0.763 |
| 2.256000000000005 | 0.067 | 0.339 | 1.724 | 0.15 | 0.764 |
| 2.260000000000005 | 0.066 | 0.338 | 1.728 | 0.15 | 0.765 |
| 2.264000000000005 | 0.066 | 0.338 | 1.733 | 0.149 | 0.765 |
| 2.268000000000005 | 0.066 | 0.338 | 1.737 | 0.149 | 0.766 |
| 2.272000000000005 | 0.065 | 0.337 | 1.742 | 0.149 | 0.767 |
| 2.276000000000005 | 0.065 | 0.337 | 1.747 | 0.148 | 0.767 |
| 2.280000000000005 | 0.065 | 0.337 | 1.751 | 0.148 | 0.768 |
| 2.284000000000005 | 0.065 | 0.337 | 1.756 | 0.147 | 0.769 |
| 2.288000000000005 | 0.064 | 0.336 | 1.76 | 0.147 | 0.769 |
| 2.292000000000005 | 0.064 | 0.336 | 1.765 | 0.147 | 0.77 |
| 2.296000000000005 | 0.064 | 0.336 | 1.769 | 0.146 | 0.771 |
| 2.300000000000005 | 0.063 | 0.335 | 1.774 | 0.146 | 0.771 |
| 2.304000000000005 | 0.063 | 0.335 | 1.778 | 0.145 | 0.772 |
| 2.308000000000005 | 0.063 | 0.335 | 1.783 | 0.145 | 0.773 |
| 2.312000000000005 | 0.063 | 0.334 | 1.788 | 0.145 | 0.773 |
| 2.316000000000005 | 0.062 | 0.334 | 1.792 | 0.144 | 0.774 |
| 2.320000000000005 | 0.062 | 0.334 | 1.797 | 0.144 | 0.774 |
| 2.324000000000005 | 0.062 | 0.334 | 1.801 | 0.144 | 0.775 |
| 2.328000000000005 | 0.061 | 0.333 | 1.806 | 0.143 | 0.776 |
| 2.332000000000005 | 0.061 | 0.333 | 1.81 | 0.143 | 0.776 |
| 2.336000000000005 | 0.061 | 0.333 | 1.815 | 0.142 | 0.777 |
| 2.340000000000005 | 0.061 | 0.332 | 1.819 | 0.142 | 0.778 |
| 2.344000000000005 | 0.06 | 0.332 | 1.824 | 0.142 | 0.778 |
| 2.348000000000005 | 0.06 | 0.332 | 1.829 | 0.141 | 0.779 |
| 2.352000000000005 | 0.06 | 0.331 | 1.833 | 0.141 | 0.779 |
| 2.356000000000005 | 0.06 | 0.331 | 1.838 | 0.141 | 0.78 |
| 2.360000000000005 | 0.059 | 0.331 | 1.842 | 0.14 | 0.781 |
| 2.364000000000005 | 0.059 | 0.33 | 1.847 | 0.14 | 0.781 |
| 2.368000000000005 | 0.059 | 0.33 | 1.851 | 0.139 | 0.782 |
| 2.372000000000005 | 0.059 | 0.33 | 1.856 | 0.139 | 0.782 |
| 2.376000000000005 | 0.058 | 0.33 | 1.86 | 0.139 | 0.783 |
| 2.380000000000005 | 0.058 | 0.329 | 1.865 | 0.138 | 0.784 |
| 2.384000000000005 | 0.058 | 0.329 | 1.869 | 0.138 | 0.784 |
| 2.388000000000005 | 0.058 | 0.329 | 1.874 | 0.138 | 0.785 |
| 2.392000000000005 | 0.057 | 0.328 | 1.879 | 0.137 | 0.785 |
| 2.396000000000005 | 0.057 | 0.328 | 1.883 | 0.137 | 0.786 |
| 2.400000000000005 | 0.057 | 0.328 | 1.888 | 0.137 | 0.787 |
| 2.404000000000005 | 0.057 | 0.327 | 1.892 | 0.136 | 0.787 |
| 2.408000000000005 | 0.056 | 0.327 | 1.897 | 0.136 | 0.788 |
| 2.412000000000005 | 0.056 | 0.327 | 1.901 | 0.135 | 0.788 |
| 2.416000000000005 | 0.056 | 0.327 | 1.906 | 0.135 | 0.789 |
| 2.420000000000005 | 0.056 | 0.326 | 1.91 | 0.135 | 0.789 |
| 2.424000000000005 | 0.055 | 0.326 | 1.915 | 0.134 | 0.79 |
| 2.428000000000005 | 0.055 | 0.326 | 1.919 | 0.134 | 0.791 |
| 2.432000000000005 | 0.055 | 0.325 | 1.924 | 0.134 | 0.791 |
| 2.436000000000005 | 0.055 | 0.325 | 1.929 | 0.133 | 0.792 |
| 2.440000000000005 | 0.055 | 0.325 | 1.933 | 0.133 | 0.792 |
| 2.444000000000005 | 0.054 | 0.324 | 1.938 | 0.133 | 0.793 |
| 2.448000000000005 | 0.054 | 0.324 | 1.942 | 0.132 | 0.793 |
| 2.452000000000005 | 0.054 | 0.324 | 1.947 | 0.132 | 0.794 |
| 2.456000000000005 | 0.054 | 0.323 | 1.951 | 0.132 | 0.794 |
| 2.460000000000005 | 0.053 | 0.323 | 1.956 | 0.131 | 0.795 |
| 2.464000000000005 | 0.053 | 0.323 | 1.96 | 0.131 | 0.796 |
| 2.468000000000005 | 0.053 | 0.323 | 1.965 | 0.131 | 0.796 |
| 2.472000000000005 | 0.053 | 0.322 | 1.969 | 0.13 | 0.797 |
| 2.476000000000005 | 0.053 | 0.322 | 1.974 | 0.13 | 0.797 |
| 2.480000000000005 | 0.052 | 0.322 | 1.978 | 0.13 | 0.798 |
| 2.484000000000005 | 0.052 | 0.321 | 1.983 | 0.129 | 0.798 |
| 2.488000000000005 | 0.052 | 0.321 | 1.987 | 0.129 | 0.799 |
| 2.492000000000005 | 0.052 | 0.321 | 1.992 | 0.129 | 0.799 |
| 2.496000000000005 | 0.051 | 0.32 | 1.997 | 0.128 | 0.8 |
| 2.500000000000005 | 0.051 | 0.32 | 2.001 | 0.128 | 0.8 |
| 2.504000000000005 | 0.051 | 0.32 | 2.006 | 0.128 | 0.801 |
| 2.508000000000005 | 0.051 | 0.32 | 2.01 | 0.127 | 0.801 |
| 2.512000000000005 | 0.051 | 0.319 | 2.015 | 0.127 | 0.802 |
| 2.516000000000005 | 0.05 | 0.319 | 2.019 | 0.127 | 0.803 |
| 2.520000000000005 | 0.05 | 0.319 | 2.024 | 0.126 | 0.803 |
| 2.524000000000005 | 0.05 | 0.318 | 2.028 | 0.126 | 0.804 |
| 2.528000000000005 | 0.05 | 0.318 | 2.033 | 0.126 | 0.804 |
| 2.532000000000005 | 0.05 | 0.318 | 2.037 | 0.126 | 0.805 |
| 2.536000000000005 | 0.049 | 0.317 | 2.042 | 0.125 | 0.805 |
| 2.540000000000005 | 0.049 | 0.317 | 2.046 | 0.125 | 0.806 |
| 2.544000000000005 | 0.049 | 0.317 | 2.051 | 0.125 | 0.806 |
| 2.548000000000005 | 0.049 | 0.317 | 2.055 | 0.124 | 0.807 |
| 2.552000000000005 | 0.049 | 0.316 | 2.06 | 0.124 | 0.807 |
| 2.556000000000005 | 0.048 | 0.316 | 2.064 | 0.124 | 0.808 |
| 2.560000000000005 | 0.048 | 0.316 | 2.069 | 0.123 | 0.808 |
| 2.564000000000005 | 0.048 | 0.315 | 2.073 | 0.123 | 0.809 |
| 2.568000000000005 | 0.048 | 0.315 | 2.078 | 0.123 | 0.809 |
| 2.572000000000005 | 0.048 | 0.315 | 2.082 | 0.122 | 0.81 |
| 2.576000000000005 | 0.047 | 0.314 | 2.087 | 0.122 | 0.81 |
| 2.580000000000005 | 0.047 | 0.314 | 2.091 | 0.122 | 0.811 |
| 2.584000000000005 | 0.047 | 0.314 | 2.096 | 0.121 | 0.811 |
| 2.588000000000005 | 0.047 | 0.314 | 2.1 | 0.121 | 0.812 |
| 2.592000000000005 | 0.047 | 0.313 | 2.105 | 0.121 | 0.812 |
| 2.596000000000005 | 0.046 | 0.313 | 2.109 | 0.121 | 0.813 |
| 2.600000000000005 | 0.046 | 0.313 | 2.114 | 0.12 | 0.813 |
| 2.604000000000005 | 0.046 | 0.312 | 2.118 | 0.12 | 0.814 |
| 2.608000000000005 | 0.046 | 0.312 | 2.123 | 0.12 | 0.814 |
| 2.612000000000005 | 0.046 | 0.312 | 2.128 | 0.119 | 0.815 |
| 2.616000000000005 | 0.046 | 0.312 | 2.132 | 0.119 | 0.815 |
| 2.620000000000005 | 0.045 | 0.311 | 2.137 | 0.119 | 0.815 |
| 2.624000000000005 | 0.045 | 0.311 | 2.141 | 0.119 | 0.816 |
| 2.628000000000005 | 0.045 | 0.311 | 2.146 | 0.118 | 0.816 |
| 2.632000000000005 | 0.045 | 0.31 | 2.15 | 0.118 | 0.817 |
| 2.636000000000005 | 0.045 | 0.31 | 2.155 | 0.118 | 0.817 |
| 2.640000000000005 | 0.044 | 0.31 | 2.159 | 0.117 | 0.818 |
| 2.644000000000005 | 0.044 | 0.309 | 2.164 | 0.117 | 0.818 |
| 2.648000000000005 | 0.044 | 0.309 | 2.168 | 0.117 | 0.819 |
| 2.652000000000005 | 0.044 | 0.309 | 2.173 | 0.116 | 0.819 |
| 2.656000000000005 | 0.044 | 0.309 | 2.177 | 0.116 | 0.82 |
| 2.660000000000005 | 0.044 | 0.308 | 2.182 | 0.116 | 0.82 |
| 2.664000000000005 | 0.043 | 0.308 | 2.186 | 0.116 | 0.821 |
| 2.668000000000005 | 0.043 | 0.308 | 2.191 | 0.115 | 0.821 |
| 2.672000000000005 | 0.043 | 0.307 | 2.195 | 0.115 | 0.821 |
| 2.676000000000005 | 0.043 | 0.307 | 2.2 | 0.115 | 0.822 |
| 2.680000000000005 | 0.043 | 0.307 | 2.204 | 0.115 | 0.822 |
| 2.684000000000005 | 0.043 | 0.307 | 2.209 | 0.114 | 0.823 |
| 2.688000000000005 | 0.042 | 0.306 | 2.213 | 0.114 | 0.823 |
| 2.692000000000005 | 0.042 | 0.306 | 2.218 | 0.114 | 0.824 |
| 2.696000000000005 | 0.042 | 0.306 | 2.222 | 0.113 | 0.824 |
| 2.700000000000005 | 0.042 | 0.305 | 2.227 | 0.113 | 0.825 |
| 2.704000000000005 | 0.042 | 0.305 | 2.231 | 0.113 | 0.825 |
| 2.708000000000005 | 0.042 | 0.305 | 2.235 | 0.113 | 0.826 |
| 2.712000000000005 | 0.041 | 0.305 | 2.24 | 0.112 | 0.826 |
| 2.716000000000005 | 0.041 | 0.304 | 2.244 | 0.112 | 0.826 |
| 2.720000000000005 | 0.041 | 0.304 | 2.249 | 0.112 | 0.827 |
| 2.724000000000005 | 0.041 | 0.304 | 2.253 | 0.111 | 0.827 |
| 2.728000000000005 | 0.041 | 0.303 | 2.258 | 0.111 | 0.828 |
| 2.732000000000005 | 0.041 | 0.303 | 2.262 | 0.111 | 0.828 |
| 2.736000000000005 | 0.04 | 0.303 | 2.267 | 0.111 | 0.829 |
| 2.740000000000005 | 0.04 | 0.303 | 2.271 | 0.11 | 0.829 |
| 2.744000000000005 | 0.04 | 0.302 | 2.276 | 0.11 | 0.829 |
| 2.748000000000005 | 0.04 | 0.302 | 2.28 | 0.11 | 0.83 |
| 2.752000000000005 | 0.04 | 0.302 | 2.285 | 0.11 | 0.83 |
| 2.756000000000005 | 0.04 | 0.301 | 2.289 | 0.109 | 0.831 |
| 2.760000000000005 | 0.04 | 0.301 | 2.294 | 0.109 | 0.831 |
| 2.764000000000005 | 0.039 | 0.301 | 2.298 | 0.109 | 0.832 |
| 2.768000000000005 | 0.039 | 0.301 | 2.303 | 0.109 | 0.832 |
| 2.772000000000005 | 0.039 | 0.3 | 2.307 | 0.108 | 0.832 |
| 2.776000000000005 | 0.039 | 0.3 | 2.312 | 0.108 | 0.833 |
| 2.780000000000005 | 0.039 | 0.3 | 2.316 | 0.108 | 0.833 |
| 2.784000000000005 | 0.039 | 0.299 | 2.321 | 0.108 | 0.834 |
| 2.788000000000006 | 0.038 | 0.299 | 2.325 | 0.107 | 0.834 |
| 2.792000000000005 | 0.038 | 0.299 | 2.33 | 0.107 | 0.834 |
| 2.796000000000005 | 0.038 | 0.299 | 2.334 | 0.107 | 0.835 |
| 2.800000000000006 | 0.038 | 0.298 | 2.339 | 0.107 | 0.835 |
| 2.804000000000006 | 0.038 | 0.298 | 2.343 | 0.106 | 0.836 |
| 2.808000000000006 | 0.038 | 0.298 | 2.348 | 0.106 | 0.836 |
| 2.812000000000006 | 0.038 | 0.297 | 2.352 | 0.106 | 0.836 |
| 2.816000000000006 | 0.037 | 0.297 | 2.356 | 0.106 | 0.837 |
| 2.820000000000006 | 0.037 | 0.297 | 2.361 | 0.105 | 0.837 |
| 2.824000000000006 | 0.037 | 0.297 | 2.365 | 0.105 | 0.838 |
| 2.828000000000006 | 0.037 | 0.296 | 2.37 | 0.105 | 0.838 |
| 2.832000000000006 | 0.037 | 0.296 | 2.374 | 0.105 | 0.838 |
| 2.836000000000006 | 0.037 | 0.296 | 2.379 | 0.104 | 0.839 |
| 2.840000000000006 | 0.037 | 0.295 | 2.383 | 0.104 | 0.839 |
| 2.844000000000006 | 0.036 | 0.295 | 2.388 | 0.104 | 0.84 |
| 2.848000000000006 | 0.036 | 0.295 | 2.392 | 0.104 | 0.84 |
| 2.852000000000006 | 0.036 | 0.295 | 2.397 | 0.103 | 0.84 |
| 2.856000000000006 | 0.036 | 0.294 | 2.401 | 0.103 | 0.841 |
| 2.860000000000006 | 0.036 | 0.294 | 2.406 | 0.103 | 0.841 |
| 2.864000000000006 | 0.036 | 0.294 | 2.41 | 0.103 | 0.842 |
| 2.868000000000006 | 0.036 | 0.294 | 2.415 | 0.102 | 0.842 |
| 2.872000000000006 | 0.036 | 0.293 | 2.419 | 0.102 | 0.842 |
| 2.876000000000006 | 0.035 | 0.293 | 2.423 | 0.102 | 0.843 |
| 2.880000000000006 | 0.035 | 0.293 | 2.428 | 0.102 | 0.843 |
| 2.884000000000006 | 0.035 | 0.292 | 2.432 | 0.101 | 0.843 |
| 2.888000000000006 | 0.035 | 0.292 | 2.437 | 0.101 | 0.844 |
| 2.892000000000006 | 0.035 | 0.292 | 2.441 | 0.101 | 0.844 |
| 2.896000000000006 | 0.035 | 0.292 | 2.446 | 0.101 | 0.845 |
| 2.900000000000006 | 0.035 | 0.291 | 2.45 | 0.1 | 0.845 |
| 2.904000000000006 | 0.035 | 0.291 | 2.455 | 0.1 | 0.845 |
| 2.908000000000006 | 0.034 | 0.291 | 2.459 | 0.1 | 0.846 |
| 2.912000000000006 | 0.034 | 0.291 | 2.464 | 0.1 | 0.846 |
| 2.916000000000006 | 0.034 | 0.29 | 2.468 | 0.1 | 0.846 |
| 2.920000000000006 | 0.034 | 0.29 | 2.473 | 0.099 | 0.847 |
| 2.924000000000006 | 0.034 | 0.29 | 2.477 | 0.099 | 0.847 |
| 2.928000000000006 | 0.034 | 0.289 | 2.481 | 0.099 | 0.847 |
| 2.932000000000006 | 0.034 | 0.289 | 2.486 | 0.099 | 0.848 |
| 2.936000000000006 | 0.034 | 0.289 | 2.49 | 0.098 | 0.848 |
| 2.940000000000006 | 0.033 | 0.289 | 2.495 | 0.098 | 0.849 |
| 2.944000000000006 | 0.033 | 0.288 | 2.499 | 0.098 | 0.849 |
| 2.948000000000006 | 0.033 | 0.288 | 2.504 | 0.098 | 0.849 |
| 2.952000000000006 | 0.033 | 0.288 | 2.508 | 0.097 | 0.85 |
| 2.956000000000006 | 0.033 | 0.288 | 2.513 | 0.097 | 0.85 |
| 2.960000000000006 | 0.033 | 0.287 | 2.517 | 0.097 | 0.85 |
| 2.964000000000006 | 0.033 | 0.287 | 2.521 | 0.097 | 0.851 |
| 2.968000000000006 | 0.033 | 0.287 | 2.526 | 0.097 | 0.851 |
| 2.972000000000006 | 0.032 | 0.286 | 2.53 | 0.096 | 0.851 |
| 2.976000000000006 | 0.032 | 0.286 | 2.535 | 0.096 | 0.852 |
| 2.980000000000006 | 0.032 | 0.286 | 2.539 | 0.096 | 0.852 |
| 2.984000000000006 | 0.032 | 0.286 | 2.544 | 0.096 | 0.852 |
| 2.988000000000006 | 0.032 | 0.285 | 2.548 | 0.096 | 0.853 |
| 2.992000000000006 | 0.032 | 0.285 | 2.553 | 0.095 | 0.853 |
| 2.996000000000006 | 0.032 | 0.285 | 2.557 | 0.095 | 0.853 |
| 3.000000000000006 | 0.032 | 0.285 | 2.561 | 0.095 | 0.854 |
| 3.004000000000006 | 0.032 | 0.284 | 2.566 | 0.095 | 0.854 |
| 3.008000000000006 | 0.031 | 0.284 | 2.57 | 0.094 | 0.854 |
| 3.012000000000006 | 0.031 | 0.284 | 2.575 | 0.094 | 0.855 |
| 3.016000000000006 | 0.031 | 0.284 | 2.579 | 0.094 | 0.855 |
| 3.020000000000006 | 0.031 | 0.283 | 2.584 | 0.094 | 0.856 |
| 3.024000000000006 | 0.031 | 0.283 | 2.588 | 0.094 | 0.856 |
| 3.028000000000006 | 0.031 | 0.283 | 2.593 | 0.093 | 0.856 |
| 3.032000000000006 | 0.031 | 0.282 | 2.597 | 0.093 | 0.857 |
| 3.036000000000006 | 0.031 | 0.282 | 2.601 | 0.093 | 0.857 |
| 3.040000000000006 | 0.031 | 0.282 | 2.606 | 0.093 | 0.857 |
| 3.044000000000006 | 0.03 | 0.282 | 2.61 | 0.093 | 0.858 |
| 3.048000000000006 | 0.03 | 0.281 | 2.615 | 0.092 | 0.858 |
| 3.052000000000006 | 0.03 | 0.281 | 2.619 | 0.092 | 0.858 |
| 3.056000000000006 | 0.03 | 0.281 | 2.624 | 0.092 | 0.858 |
| 3.060000000000006 | 0.03 | 0.281 | 2.628 | 0.092 | 0.859 |
| 3.064000000000006 | 0.03 | 0.28 | 2.632 | 0.092 | 0.859 |
| 3.068000000000006 | 0.03 | 0.28 | 2.637 | 0.091 | 0.859 |
| 3.072000000000006 | 0.03 | 0.28 | 2.641 | 0.091 | 0.86 |
| 3.076000000000006 | 0.03 | 0.28 | 2.646 | 0.091 | 0.86 |
| 3.080000000000006 | 0.029 | 0.279 | 2.65 | 0.091 | 0.86 |
| 3.084000000000006 | 0.029 | 0.279 | 2.655 | 0.09 | 0.861 |
| 3.088000000000006 | 0.029 | 0.279 | 2.659 | 0.09 | 0.861 |
| 3.092000000000006 | 0.029 | 0.279 | 2.663 | 0.09 | 0.861 |
| 3.096000000000006 | 0.029 | 0.278 | 2.668 | 0.09 | 0.862 |
| 3.100000000000006 | 0.029 | 0.278 | 2.672 | 0.09 | 0.862 |
| 3.104000000000006 | 0.029 | 0.278 | 2.677 | 0.09 | 0.862 |
| 3.108000000000006 | 0.029 | 0.278 | 2.681 | 0.089 | 0.863 |
| 3.112000000000006 | 0.029 | 0.277 | 2.685 | 0.089 | 0.863 |
| 3.116000000000006 | 0.029 | 0.277 | 2.69 | 0.089 | 0.863 |
| 3.120000000000006 | 0.028 | 0.277 | 2.694 | 0.089 | 0.864 |
| 3.124000000000006 | 0.028 | 0.277 | 2.699 | 0.089 | 0.864 |
| 3.128000000000006 | 0.028 | 0.276 | 2.703 | 0.088 | 0.864 |
| 3.132000000000006 | 0.028 | 0.276 | 2.708 | 0.088 | 0.864 |
| 3.136000000000006 | 0.028 | 0.276 | 2.712 | 0.088 | 0.865 |
| 3.140000000000006 | 0.028 | 0.276 | 2.716 | 0.088 | 0.865 |
| 3.144000000000006 | 0.028 | 0.275 | 2.721 | 0.088 | 0.865 |
| 3.148000000000006 | 0.028 | 0.275 | 2.725 | 0.087 | 0.866 |
| 3.152000000000006 | 0.028 | 0.275 | 2.73 | 0.087 | 0.866 |
| 3.156000000000006 | 0.028 | 0.274 | 2.734 | 0.087 | 0.866 |
| 3.160000000000006 | 0.027 | 0.274 | 2.738 | 0.087 | 0.867 |
| 3.164000000000006 | 0.027 | 0.274 | 2.743 | 0.087 | 0.867 |
| 3.168000000000006 | 0.027 | 0.274 | 2.747 | 0.086 | 0.867 |
| 3.172000000000006 | 0.027 | 0.273 | 2.752 | 0.086 | 0.868 |
| 3.176000000000006 | 0.027 | 0.273 | 2.756 | 0.086 | 0.868 |
| 3.180000000000006 | 0.027 | 0.273 | 2.761 | 0.086 | 0.868 |
| 3.184000000000006 | 0.027 | 0.273 | 2.765 | 0.086 | 0.868 |
| 3.188000000000006 | 0.027 | 0.272 | 2.769 | 0.085 | 0.869 |
| 3.192000000000006 | 0.027 | 0.272 | 2.774 | 0.085 | 0.869 |
| 3.196000000000006 | 0.027 | 0.272 | 2.778 | 0.085 | 0.869 |
| 3.200000000000006 | 0.027 | 0.272 | 2.783 | 0.085 | 0.87 |
| 3.204000000000006 | 0.026 | 0.271 | 2.787 | 0.085 | 0.87 |
| 3.208000000000006 | 0.026 | 0.271 | 2.791 | 0.085 | 0.87 |
| 3.212000000000006 | 0.026 | 0.271 | 2.796 | 0.084 | 0.87 |
| 3.216000000000006 | 0.026 | 0.271 | 2.8 | 0.084 | 0.871 |
| 3.220000000000006 | 0.026 | 0.27 | 2.805 | 0.084 | 0.871 |
| 3.224000000000006 | 0.026 | 0.27 | 2.809 | 0.084 | 0.871 |
| 3.228000000000006 | 0.026 | 0.27 | 2.813 | 0.084 | 0.872 |
| 3.232000000000006 | 0.026 | 0.27 | 2.818 | 0.083 | 0.872 |
| 3.236000000000006 | 0.026 | 0.27 | 2.822 | 0.083 | 0.872 |
| 3.240000000000006 | 0.026 | 0.269 | 2.827 | 0.083 | 0.872 |
| 3.244000000000006 | 0.026 | 0.269 | 2.831 | 0.083 | 0.873 |
| 3.248000000000006 | 0.025 | 0.269 | 2.835 | 0.083 | 0.873 |
| 3.252000000000006 | 0.025 | 0.269 | 2.84 | 0.083 | 0.873 |
| 3.256000000000006 | 0.025 | 0.268 | 2.844 | 0.082 | 0.874 |
| 3.260000000000006 | 0.025 | 0.268 | 2.849 | 0.082 | 0.874 |
| 3.264000000000006 | 0.025 | 0.268 | 2.853 | 0.082 | 0.874 |
| 3.268000000000006 | 0.025 | 0.268 | 2.857 | 0.082 | 0.874 |
| 3.272000000000006 | 0.025 | 0.267 | 2.862 | 0.082 | 0.875 |
| 3.276000000000006 | 0.025 | 0.267 | 2.866 | 0.082 | 0.875 |
| 3.280000000000006 | 0.025 | 0.267 | 2.871 | 0.081 | 0.875 |
| 3.284000000000006 | 0.025 | 0.267 | 2.875 | 0.081 | 0.875 |
| 3.288000000000006 | 0.025 | 0.266 | 2.879 | 0.081 | 0.876 |
| 3.292000000000006 | 0.025 | 0.266 | 2.884 | 0.081 | 0.876 |
| 3.296000000000006 | 0.024 | 0.266 | 2.888 | 0.081 | 0.876 |
| 3.300000000000006 | 0.024 | 0.266 | 2.893 | 0.08 | 0.877 |
| 3.304000000000006 | 0.024 | 0.265 | 2.897 | 0.08 | 0.877 |
| 3.308000000000006 | 0.024 | 0.265 | 2.901 | 0.08 | 0.877 |
| 3.312000000000006 | 0.024 | 0.265 | 2.906 | 0.08 | 0.877 |
| 3.316000000000006 | 0.024 | 0.265 | 2.91 | 0.08 | 0.878 |
| 3.320000000000006 | 0.024 | 0.264 | 2.915 | 0.08 | 0.878 |
| 3.324000000000006 | 0.024 | 0.264 | 2.919 | 0.079 | 0.878 |
| 3.328000000000006 | 0.024 | 0.264 | 2.923 | 0.079 | 0.878 |
| 3.332000000000006 | 0.024 | 0.264 | 2.928 | 0.079 | 0.879 |
| 3.336000000000006 | 0.024 | 0.263 | 2.932 | 0.079 | 0.879 |
| 3.340000000000006 | 0.024 | 0.263 | 2.936 | 0.079 | 0.879 |
| 3.344000000000006 | 0.024 | 0.263 | 2.941 | 0.079 | 0.879 |
| 3.348000000000006 | 0.023 | 0.263 | 2.945 | 0.078 | 0.88 |
| 3.352000000000006 | 0.023 | 0.263 | 2.95 | 0.078 | 0.88 |
| 3.356000000000006 | 0.023 | 0.262 | 2.954 | 0.078 | 0.88 |
| 3.360000000000006 | 0.023 | 0.262 | 2.958 | 0.078 | 0.88 |
| 3.364000000000006 | 0.023 | 0.262 | 2.963 | 0.078 | 0.881 |
| 3.368000000000006 | 0.023 | 0.262 | 2.967 | 0.078 | 0.881 |
| 3.372000000000006 | 0.023 | 0.261 | 2.971 | 0.078 | 0.881 |
| 3.376000000000006 | 0.023 | 0.261 | 2.976 | 0.077 | 0.881 |
| 3.380000000000006 | 0.023 | 0.261 | 2.98 | 0.077 | 0.882 |
| 3.384000000000006 | 0.023 | 0.261 | 2.985 | 0.077 | 0.882 |
| 3.388000000000006 | 0.023 | 0.26 | 2.989 | 0.077 | 0.882 |
| 3.392000000000006 | 0.023 | 0.26 | 2.993 | 0.077 | 0.882 |
| 3.396000000000006 | 0.023 | 0.26 | 2.998 | 0.077 | 0.883 |
| 3.400000000000006 | 0.022 | 0.26 | 3.002 | 0.076 | 0.883 |
| 3.404000000000006 | 0.022 | 0.259 | 3.007 | 0.076 | 0.883 |
| 3.408000000000006 | 0.022 | 0.259 | 3.011 | 0.076 | 0.883 |
| 3.412000000000006 | 0.022 | 0.259 | 3.015 | 0.076 | 0.884 |
| 3.416000000000006 | 0.022 | 0.259 | 3.02 | 0.076 | 0.884 |
| 3.420000000000006 | 0.022 | 0.259 | 3.024 | 0.076 | 0.884 |
| 3.424000000000006 | 0.022 | 0.258 | 3.028 | 0.075 | 0.884 |
| 3.428000000000006 | 0.022 | 0.258 | 3.033 | 0.075 | 0.885 |
| 3.432000000000006 | 0.022 | 0.258 | 3.037 | 0.075 | 0.885 |
| 3.436000000000006 | 0.022 | 0.258 | 3.041 | 0.075 | 0.885 |
| 3.440000000000006 | 0.022 | 0.257 | 3.046 | 0.075 | 0.885 |
| 3.444000000000006 | 0.022 | 0.257 | 3.05 | 0.075 | 0.886 |
| 3.448000000000006 | 0.022 | 0.257 | 3.055 | 0.075 | 0.886 |
| 3.452000000000006 | 0.022 | 0.257 | 3.059 | 0.074 | 0.886 |
| 3.456000000000006 | 0.021 | 0.256 | 3.063 | 0.074 | 0.886 |
| 3.460000000000006 | 0.021 | 0.256 | 3.068 | 0.074 | 0.887 |
| 3.464000000000006 | 0.021 | 0.256 | 3.072 | 0.074 | 0.887 |
| 3.468000000000006 | 0.021 | 0.256 | 3.076 | 0.074 | 0.887 |
| 3.472000000000006 | 0.021 | 0.256 | 3.081 | 0.074 | 0.887 |
| 3.476000000000006 | 0.021 | 0.255 | 3.085 | 0.073 | 0.888 |
| 3.480000000000006 | 0.021 | 0.255 | 3.09 | 0.073 | 0.888 |
| 3.484000000000006 | 0.021 | 0.255 | 3.094 | 0.073 | 0.888 |
| 3.488000000000006 | 0.021 | 0.255 | 3.098 | 0.073 | 0.888 |
| 3.492000000000006 | 0.021 | 0.254 | 3.103 | 0.073 | 0.888 |
| 3.496000000000006 | 0.021 | 0.254 | 3.107 | 0.073 | 0.889 |
| 3.500000000000006 | 0.021 | 0.254 | 3.111 | 0.073 | 0.889 |
| 3.504000000000006 | 0.021 | 0.254 | 3.116 | 0.072 | 0.889 |
| 3.508000000000006 | 0.021 | 0.254 | 3.12 | 0.072 | 0.889 |
| 3.512000000000006 | 0.021 | 0.253 | 3.124 | 0.072 | 0.89 |
| 3.516000000000006 | 0.02 | 0.253 | 3.129 | 0.072 | 0.89 |
| 3.520000000000006 | 0.02 | 0.253 | 3.133 | 0.072 | 0.89 |
| 3.524000000000006 | 0.02 | 0.253 | 3.138 | 0.072 | 0.89 |
| 3.528000000000006 | 0.02 | 0.252 | 3.142 | 0.072 | 0.891 |
| 3.532000000000006 | 0.02 | 0.252 | 3.146 | 0.071 | 0.891 |
| 3.536000000000006 | 0.02 | 0.252 | 3.151 | 0.071 | 0.891 |
| 3.540000000000006 | 0.02 | 0.252 | 3.155 | 0.071 | 0.891 |
| 3.544000000000006 | 0.02 | 0.252 | 3.159 | 0.071 | 0.891 |
| 3.548000000000006 | 0.02 | 0.251 | 3.164 | 0.071 | 0.892 |
| 3.552000000000006 | 0.02 | 0.251 | 3.168 | 0.071 | 0.892 |
| 3.556000000000006 | 0.02 | 0.251 | 3.172 | 0.071 | 0.892 |
| 3.560000000000006 | 0.02 | 0.251 | 3.177 | 0.07 | 0.892 |
| 3.564000000000006 | 0.02 | 0.25 | 3.181 | 0.07 | 0.893 |
| 3.568000000000006 | 0.02 | 0.25 | 3.185 | 0.07 | 0.893 |
| 3.572000000000006 | 0.02 | 0.25 | 3.19 | 0.07 | 0.893 |
| 3.576000000000006 | 0.02 | 0.25 | 3.194 | 0.07 | 0.893 |
| 3.580000000000006 | 0.019 | 0.25 | 3.198 | 0.07 | 0.893 |
| 3.584000000000006 | 0.019 | 0.249 | 3.203 | 0.07 | 0.894 |
| 3.588000000000006 | 0.019 | 0.249 | 3.207 | 0.069 | 0.894 |
| 3.592000000000006 | 0.019 | 0.249 | 3.211 | 0.069 | 0.894 |
| 3.596000000000006 | 0.019 | 0.249 | 3.216 | 0.069 | 0.894 |
| 3.600000000000006 | 0.019 | 0.248 | 3.22 | 0.069 | 0.894 |
| 3.604000000000006 | 0.019 | 0.248 | 3.225 | 0.069 | 0.895 |
| 3.608000000000006 | 0.019 | 0.248 | 3.229 | 0.069 | 0.895 |
| 3.612000000000006 | 0.019 | 0.248 | 3.233 | 0.069 | 0.895 |
| 3.616000000000006 | 0.019 | 0.248 | 3.238 | 0.068 | 0.895 |
| 3.620000000000006 | 0.019 | 0.247 | 3.242 | 0.068 | 0.896 |
| 3.624000000000006 | 0.019 | 0.247 | 3.246 | 0.068 | 0.896 |
| 3.628000000000006 | 0.019 | 0.247 | 3.251 | 0.068 | 0.896 |
| 3.632000000000006 | 0.019 | 0.247 | 3.255 | 0.068 | 0.896 |
| 3.636000000000006 | 0.019 | 0.247 | 3.259 | 0.068 | 0.896 |
| 3.640000000000006 | 0.019 | 0.246 | 3.264 | 0.068 | 0.897 |
| 3.644000000000006 | 0.019 | 0.246 | 3.268 | 0.068 | 0.897 |
| 3.648000000000006 | 0.018 | 0.246 | 3.272 | 0.067 | 0.897 |
| 3.652000000000006 | 0.018 | 0.246 | 3.277 | 0.067 | 0.897 |
| 3.656000000000006 | 0.018 | 0.245 | 3.281 | 0.067 | 0.897 |
| 3.660000000000006 | 0.018 | 0.245 | 3.285 | 0.067 | 0.898 |
| 3.664000000000006 | 0.018 | 0.245 | 3.29 | 0.067 | 0.898 |
| 3.668000000000006 | 0.018 | 0.245 | 3.294 | 0.067 | 0.898 |
| 3.672000000000006 | 0.018 | 0.245 | 3.298 | 0.067 | 0.898 |
| 3.676000000000006 | 0.018 | 0.244 | 3.303 | 0.066 | 0.898 |
| 3.680000000000006 | 0.018 | 0.244 | 3.307 | 0.066 | 0.899 |
| 3.684000000000006 | 0.018 | 0.244 | 3.311 | 0.066 | 0.899 |
| 3.688000000000006 | 0.018 | 0.244 | 3.316 | 0.066 | 0.899 |
| 3.692000000000006 | 0.018 | 0.244 | 3.32 | 0.066 | 0.899 |
| 3.696000000000006 | 0.018 | 0.243 | 3.324 | 0.066 | 0.899 |
| 3.700000000000006 | 0.018 | 0.243 | 3.329 | 0.066 | 0.9 |
| 3.704000000000006 | 0.018 | 0.243 | 3.333 | 0.066 | 0.9 |
| 3.708000000000006 | 0.018 | 0.243 | 3.337 | 0.065 | 0.9 |
| 3.712000000000006 | 0.018 | 0.243 | 3.342 | 0.065 | 0.9 |
| 3.716000000000006 | 0.018 | 0.242 | 3.346 | 0.065 | 0.9 |
| 3.720000000000006 | 0.017 | 0.242 | 3.35 | 0.065 | 0.901 |
| 3.724000000000006 | 0.017 | 0.242 | 3.355 | 0.065 | 0.901 |
| 3.728000000000006 | 0.017 | 0.242 | 3.359 | 0.065 | 0.901 |
| 3.732000000000006 | 0.017 | 0.241 | 3.363 | 0.065 | 0.901 |
| 3.736000000000006 | 0.017 | 0.241 | 3.368 | 0.065 | 0.901 |
| 3.740000000000006 | 0.017 | 0.241 | 3.372 | 0.064 | 0.902 |
| 3.744000000000006 | 0.017 | 0.241 | 3.376 | 0.064 | 0.902 |
| 3.748000000000006 | 0.017 | 0.241 | 3.381 | 0.064 | 0.902 |
| 3.752000000000006 | 0.017 | 0.24 | 3.385 | 0.064 | 0.902 |
| 3.756000000000006 | 0.017 | 0.24 | 3.389 | 0.064 | 0.902 |
| 3.760000000000006 | 0.017 | 0.24 | 3.394 | 0.064 | 0.903 |
| 3.764000000000006 | 0.017 | 0.24 | 3.398 | 0.064 | 0.903 |
| 3.768000000000006 | 0.017 | 0.24 | 3.402 | 0.064 | 0.903 |
| 3.772000000000006 | 0.017 | 0.239 | 3.407 | 0.063 | 0.903 |
| 3.776000000000006 | 0.017 | 0.239 | 3.411 | 0.063 | 0.903 |
| 3.780000000000006 | 0.017 | 0.239 | 3.415 | 0.063 | 0.904 |
| 3.784000000000006 | 0.017 | 0.239 | 3.42 | 0.063 | 0.904 |
| 3.788000000000006 | 0.017 | 0.239 | 3.424 | 0.063 | 0.904 |
| 3.792000000000006 | 0.017 | 0.238 | 3.428 | 0.063 | 0.904 |
| 3.796000000000006 | 0.017 | 0.238 | 3.433 | 0.063 | 0.904 |
| 3.800000000000006 | 0.016 | 0.238 | 3.437 | 0.063 | 0.904 |
| 3.804000000000006 | 0.016 | 0.238 | 3.441 | 0.063 | 0.905 |
| 3.808000000000006 | 0.016 | 0.238 | 3.446 | 0.062 | 0.905 |
| 3.812000000000006 | 0.016 | 0.237 | 3.45 | 0.062 | 0.905 |
| 3.816000000000006 | 0.016 | 0.237 | 3.454 | 0.062 | 0.905 |
| 3.820000000000006 | 0.016 | 0.237 | 3.458 | 0.062 | 0.905 |
| 3.824000000000006 | 0.016 | 0.237 | 3.463 | 0.062 | 0.906 |
| 3.828000000000006 | 0.016 | 0.237 | 3.467 | 0.062 | 0.906 |
| 3.832000000000006 | 0.016 | 0.236 | 3.471 | 0.062 | 0.906 |
| 3.836000000000006 | 0.016 | 0.236 | 3.476 | 0.062 | 0.906 |
| 3.840000000000006 | 0.016 | 0.236 | 3.48 | 0.061 | 0.906 |
| 3.844000000000006 | 0.016 | 0.236 | 3.484 | 0.061 | 0.906 |
| 3.848000000000006 | 0.016 | 0.236 | 3.489 | 0.061 | 0.907 |
| 3.852000000000006 | 0.016 | 0.235 | 3.493 | 0.061 | 0.907 |
| 3.856000000000006 | 0.016 | 0.235 | 3.497 | 0.061 | 0.907 |
| 3.860000000000006 | 0.016 | 0.235 | 3.502 | 0.061 | 0.907 |
| 3.864000000000006 | 0.016 | 0.235 | 3.506 | 0.061 | 0.907 |
| 3.868000000000006 | 0.016 | 0.235 | 3.51 | 0.061 | 0.908 |
| 3.872000000000006 | 0.016 | 0.234 | 3.515 | 0.061 | 0.908 |
| 3.876000000000006 | 0.016 | 0.234 | 3.519 | 0.06 | 0.908 |
| 3.880000000000006 | 0.016 | 0.234 | 3.523 | 0.06 | 0.908 |
| 3.884000000000006 | 0.016 | 0.234 | 3.527 | 0.06 | 0.908 |
| 3.888000000000007 | 0.015 | 0.234 | 3.532 | 0.06 | 0.908 |
| 3.892000000000006 | 0.015 | 0.233 | 3.536 | 0.06 | 0.909 |
| 3.896000000000006 | 0.015 | 0.233 | 3.54 | 0.06 | 0.909 |
| 3.900000000000007 | 0.015 | 0.233 | 3.545 | 0.06 | 0.909 |
| 3.904000000000007 | 0.015 | 0.233 | 3.549 | 0.06 | 0.909 |
| 3.908000000000007 | 0.015 | 0.233 | 3.553 | 0.06 | 0.909 |
| 3.912000000000007 | 0.015 | 0.232 | 3.558 | 0.059 | 0.909 |
| 3.916000000000007 | 0.015 | 0.232 | 3.562 | 0.059 | 0.91 |
| 3.920000000000007 | 0.015 | 0.232 | 3.566 | 0.059 | 0.91 |
| 3.924000000000007 | 0.015 | 0.232 | 3.571 | 0.059 | 0.91 |
| 3.928000000000007 | 0.015 | 0.232 | 3.575 | 0.059 | 0.91 |
| 3.932000000000007 | 0.015 | 0.232 | 3.579 | 0.059 | 0.91 |
| 3.936000000000007 | 0.015 | 0.231 | 3.583 | 0.059 | 0.91 |
| 3.940000000000007 | 0.015 | 0.231 | 3.588 | 0.059 | 0.911 |
| 3.944000000000007 | 0.015 | 0.231 | 3.592 | 0.059 | 0.911 |
| 3.948000000000007 | 0.015 | 0.231 | 3.596 | 0.058 | 0.911 |
| 3.952000000000007 | 0.015 | 0.231 | 3.601 | 0.058 | 0.911 |
| 3.956000000000007 | 0.015 | 0.23 | 3.605 | 0.058 | 0.911 |
| 3.960000000000007 | 0.015 | 0.23 | 3.609 | 0.058 | 0.911 |
| 3.964000000000007 | 0.015 | 0.23 | 3.614 | 0.058 | 0.912 |
| 3.968000000000007 | 0.015 | 0.23 | 3.618 | 0.058 | 0.912 |
| 3.972000000000007 | 0.015 | 0.23 | 3.622 | 0.058 | 0.912 |
| 3.976000000000007 | 0.015 | 0.229 | 3.627 | 0.058 | 0.912 |
| 3.980000000000007 | 0.014 | 0.229 | 3.631 | 0.058 | 0.912 |
| 3.984000000000007 | 0.014 | 0.229 | 3.635 | 0.057 | 0.912 |
| 3.988000000000007 | 0.014 | 0.229 | 3.639 | 0.057 | 0.913 |
| 3.992000000000007 | 0.014 | 0.229 | 3.644 | 0.057 | 0.913 |
| 3.996000000000007 | 0.014 | 0.228 | 3.648 | 0.057 | 0.913 |
| 4.000000000000006 | 0.014 | 0.228 | 3.652 | 0.057 | 0.913 |